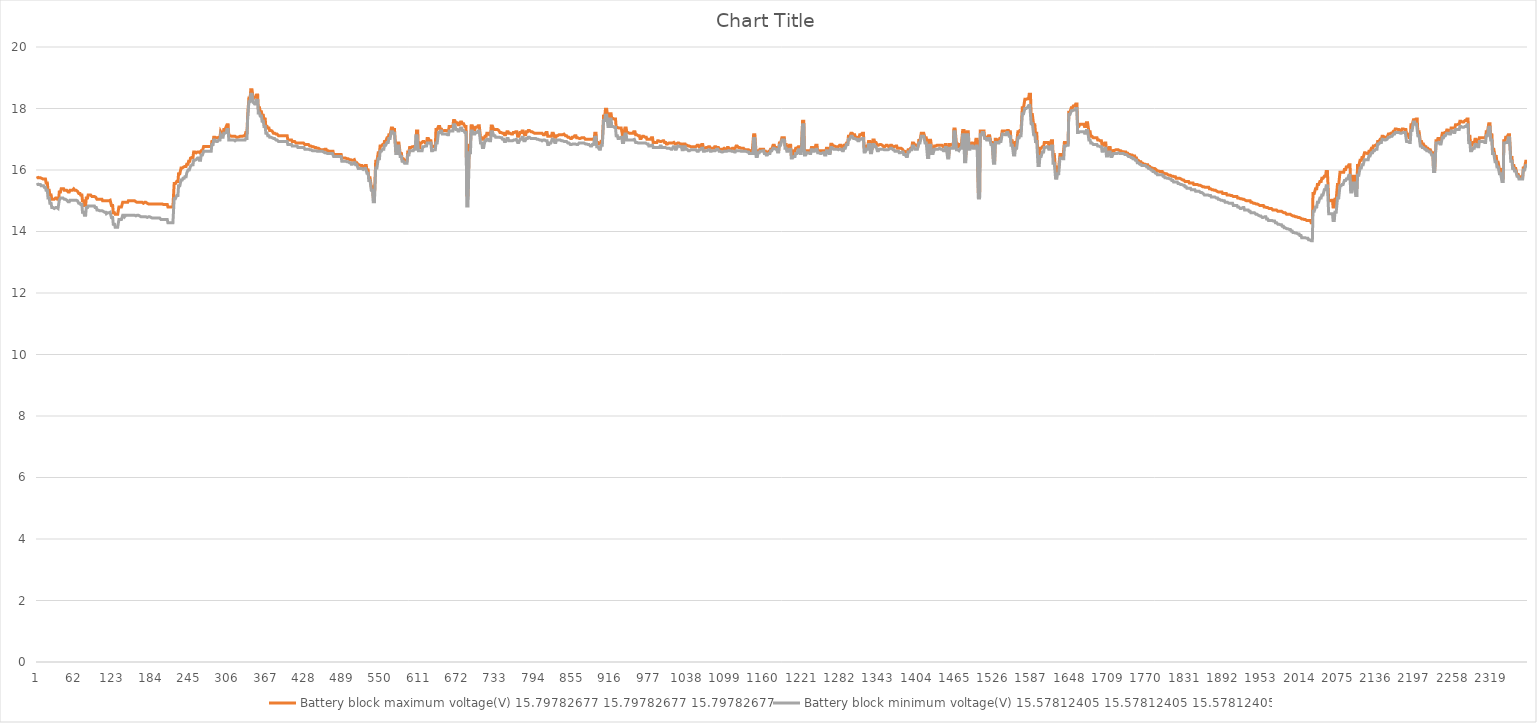
| Category | Battery block maximum voltage(V) | Battery block minimum voltage(V) |
|---|---|---|
| 0 | 15.798 | 15.578 |
| 1 | 15.748 | 15.528 |
| 2 | 15.748 | 15.528 |
| 3 | 15.748 | 15.528 |
| 4 | 15.748 | 15.528 |
| 5 | 15.748 | 15.528 |
| 6 | 15.728 | 15.488 |
| 7 | 15.728 | 15.488 |
| 8 | 15.708 | 15.488 |
| 9 | 15.708 | 15.488 |
| 10 | 15.708 | 15.488 |
| 11 | 15.708 | 15.438 |
| 12 | 15.708 | 15.438 |
| 13 | 15.708 | 15.438 |
| 14 | 15.578 | 15.338 |
| 15 | 15.578 | 15.338 |
| 16 | 15.578 | 15.338 |
| 17 | 15.338 | 15.087 |
| 18 | 15.338 | 15.087 |
| 19 | 15.338 | 15.087 |
| 20 | 15.188 | 14.918 |
| 21 | 15.188 | 14.918 |
| 22 | 15.188 | 14.918 |
| 23 | 15.047 | 14.777 |
| 24 | 15.047 | 14.777 |
| 25 | 15.047 | 14.777 |
| 26 | 15.047 | 14.748 |
| 27 | 15.047 | 14.748 |
| 28 | 15.047 | 14.748 |
| 29 | 15.087 | 14.777 |
| 30 | 15.087 | 14.777 |
| 31 | 15.087 | 14.777 |
| 32 | 15.047 | 14.748 |
| 33 | 15.047 | 14.748 |
| 34 | 15.047 | 14.748 |
| 35 | 15.288 | 15.018 |
| 36 | 15.288 | 15.018 |
| 37 | 15.288 | 15.087 |
| 38 | 15.388 | 15.087 |
| 39 | 15.388 | 15.087 |
| 40 | 15.388 | 15.087 |
| 41 | 15.388 | 15.087 |
| 42 | 15.388 | 15.087 |
| 43 | 15.338 | 15.047 |
| 44 | 15.338 | 15.047 |
| 45 | 15.338 | 15.047 |
| 46 | 15.338 | 15.018 |
| 47 | 15.338 | 15.018 |
| 48 | 15.338 | 15.018 |
| 49 | 15.288 | 14.968 |
| 50 | 15.288 | 14.968 |
| 51 | 15.288 | 14.968 |
| 52 | 15.338 | 15.018 |
| 53 | 15.338 | 15.018 |
| 54 | 15.338 | 15.018 |
| 55 | 15.338 | 15.018 |
| 56 | 15.338 | 15.018 |
| 57 | 15.338 | 15.018 |
| 58 | 15.388 | 15.018 |
| 59 | 15.388 | 15.018 |
| 60 | 15.338 | 15.018 |
| 61 | 15.338 | 15.018 |
| 62 | 15.338 | 15.018 |
| 63 | 15.307 | 14.998 |
| 64 | 15.307 | 14.998 |
| 65 | 15.307 | 14.998 |
| 66 | 15.238 | 14.918 |
| 67 | 15.238 | 14.918 |
| 68 | 15.238 | 14.918 |
| 69 | 15.188 | 14.878 |
| 70 | 15.188 | 14.878 |
| 71 | 15.188 | 14.878 |
| 72 | 14.998 | 14.627 |
| 73 | 14.998 | 14.627 |
| 74 | 14.998 | 14.627 |
| 75 | 14.848 | 14.527 |
| 76 | 14.848 | 14.527 |
| 77 | 14.848 | 14.527 |
| 78 | 15.087 | 14.777 |
| 79 | 15.087 | 14.777 |
| 80 | 15.087 | 14.777 |
| 81 | 15.188 | 14.827 |
| 82 | 15.188 | 14.827 |
| 83 | 15.188 | 14.827 |
| 84 | 15.188 | 14.827 |
| 85 | 15.188 | 14.827 |
| 86 | 15.188 | 14.827 |
| 87 | 15.137 | 14.827 |
| 88 | 15.137 | 14.827 |
| 89 | 15.137 | 14.827 |
| 90 | 15.137 | 14.827 |
| 91 | 15.137 | 14.827 |
| 92 | 15.118 | 14.777 |
| 93 | 15.118 | 14.777 |
| 94 | 15.118 | 14.777 |
| 95 | 15.047 | 14.698 |
| 96 | 15.047 | 14.698 |
| 97 | 15.047 | 14.698 |
| 98 | 15.047 | 14.677 |
| 99 | 15.047 | 14.677 |
| 100 | 15.047 | 14.677 |
| 101 | 15.047 | 14.677 |
| 102 | 15.047 | 14.677 |
| 103 | 15.047 | 14.677 |
| 104 | 14.998 | 14.658 |
| 105 | 14.998 | 14.658 |
| 106 | 14.998 | 14.658 |
| 107 | 14.998 | 14.627 |
| 108 | 14.998 | 14.627 |
| 109 | 14.998 | 14.627 |
| 110 | 14.998 | 14.577 |
| 111 | 14.998 | 14.577 |
| 112 | 14.998 | 14.608 |
| 113 | 14.998 | 14.608 |
| 114 | 14.998 | 14.608 |
| 115 | 15.018 | 14.627 |
| 116 | 15.018 | 14.627 |
| 117 | 15.018 | 14.627 |
| 118 | 14.848 | 14.458 |
| 119 | 14.848 | 14.458 |
| 120 | 14.848 | 14.458 |
| 121 | 14.608 | 14.238 |
| 122 | 14.608 | 14.238 |
| 123 | 14.608 | 14.238 |
| 124 | 14.558 | 14.138 |
| 125 | 14.558 | 14.138 |
| 126 | 14.558 | 14.138 |
| 127 | 14.558 | 14.138 |
| 128 | 14.558 | 14.138 |
| 129 | 14.558 | 14.138 |
| 130 | 14.798 | 14.388 |
| 131 | 14.798 | 14.388 |
| 132 | 14.798 | 14.388 |
| 133 | 14.798 | 14.388 |
| 134 | 14.798 | 14.388 |
| 135 | 14.798 | 14.388 |
| 136 | 14.948 | 14.527 |
| 137 | 14.948 | 14.527 |
| 138 | 14.948 | 14.527 |
| 139 | 14.948 | 14.478 |
| 140 | 14.948 | 14.478 |
| 141 | 14.948 | 14.527 |
| 142 | 14.948 | 14.527 |
| 143 | 14.948 | 14.527 |
| 144 | 14.948 | 14.527 |
| 145 | 14.998 | 14.527 |
| 146 | 14.998 | 14.527 |
| 147 | 14.998 | 14.527 |
| 148 | 14.998 | 14.527 |
| 149 | 14.998 | 14.527 |
| 150 | 14.998 | 14.527 |
| 151 | 14.998 | 14.527 |
| 152 | 14.998 | 14.527 |
| 153 | 14.998 | 14.527 |
| 154 | 14.998 | 14.527 |
| 155 | 14.998 | 14.527 |
| 156 | 14.968 | 14.508 |
| 157 | 14.968 | 14.508 |
| 158 | 14.968 | 14.508 |
| 159 | 14.948 | 14.527 |
| 160 | 14.948 | 14.527 |
| 161 | 14.948 | 14.527 |
| 162 | 14.948 | 14.508 |
| 163 | 14.948 | 14.508 |
| 164 | 14.948 | 14.508 |
| 165 | 14.948 | 14.478 |
| 166 | 14.948 | 14.478 |
| 167 | 14.948 | 14.478 |
| 168 | 14.918 | 14.478 |
| 169 | 14.918 | 14.478 |
| 170 | 14.918 | 14.478 |
| 171 | 14.948 | 14.478 |
| 172 | 14.948 | 14.478 |
| 173 | 14.948 | 14.478 |
| 174 | 14.918 | 14.458 |
| 175 | 14.918 | 14.458 |
| 176 | 14.898 | 14.478 |
| 177 | 14.898 | 14.478 |
| 178 | 14.898 | 14.478 |
| 179 | 14.898 | 14.478 |
| 180 | 14.898 | 14.458 |
| 181 | 14.898 | 14.458 |
| 182 | 14.898 | 14.438 |
| 183 | 14.898 | 14.438 |
| 184 | 14.898 | 14.438 |
| 185 | 14.898 | 14.438 |
| 186 | 14.898 | 14.438 |
| 187 | 14.898 | 14.438 |
| 188 | 14.898 | 14.438 |
| 189 | 14.898 | 14.438 |
| 190 | 14.898 | 14.438 |
| 191 | 14.898 | 14.438 |
| 192 | 14.898 | 14.438 |
| 193 | 14.898 | 14.438 |
| 194 | 14.898 | 14.438 |
| 195 | 14.898 | 14.438 |
| 196 | 14.898 | 14.438 |
| 197 | 14.898 | 14.388 |
| 198 | 14.898 | 14.388 |
| 199 | 14.898 | 14.388 |
| 200 | 14.878 | 14.388 |
| 201 | 14.878 | 14.388 |
| 202 | 14.878 | 14.388 |
| 203 | 14.878 | 14.388 |
| 204 | 14.878 | 14.388 |
| 205 | 14.878 | 14.388 |
| 206 | 14.878 | 14.388 |
| 207 | 14.878 | 14.388 |
| 208 | 14.798 | 14.288 |
| 209 | 14.798 | 14.288 |
| 210 | 14.798 | 14.288 |
| 211 | 14.798 | 14.288 |
| 212 | 14.798 | 14.288 |
| 213 | 14.798 | 14.288 |
| 214 | 14.798 | 14.288 |
| 215 | 14.798 | 14.288 |
| 216 | 14.798 | 14.288 |
| 217 | 14.798 | 14.288 |
| 218 | 15.557 | 15.068 |
| 219 | 15.557 | 15.068 |
| 220 | 15.557 | 15.068 |
| 221 | 15.557 | 15.068 |
| 222 | 15.628 | 15.168 |
| 223 | 15.628 | 15.168 |
| 224 | 15.628 | 15.168 |
| 225 | 15.877 | 15.488 |
| 226 | 15.877 | 15.488 |
| 227 | 15.877 | 15.488 |
| 228 | 15.877 | 15.488 |
| 229 | 16.068 | 15.678 |
| 230 | 16.068 | 15.678 |
| 231 | 16.068 | 15.678 |
| 232 | 16.098 | 15.728 |
| 233 | 16.098 | 15.728 |
| 234 | 16.098 | 15.728 |
| 235 | 16.118 | 15.777 |
| 236 | 16.118 | 15.777 |
| 237 | 16.118 | 15.777 |
| 238 | 16.187 | 15.898 |
| 239 | 16.187 | 15.898 |
| 240 | 16.187 | 15.998 |
| 241 | 16.287 | 15.998 |
| 242 | 16.287 | 15.998 |
| 243 | 16.287 | 15.998 |
| 244 | 16.387 | 16.118 |
| 245 | 16.387 | 16.118 |
| 246 | 16.408 | 16.168 |
| 247 | 16.408 | 16.168 |
| 248 | 16.408 | 16.168 |
| 249 | 16.588 | 16.318 |
| 250 | 16.588 | 16.318 |
| 251 | 16.588 | 16.318 |
| 252 | 16.588 | 16.318 |
| 253 | 16.557 | 16.337 |
| 254 | 16.557 | 16.337 |
| 255 | 16.588 | 16.387 |
| 256 | 16.588 | 16.387 |
| 257 | 16.588 | 16.387 |
| 258 | 16.557 | 16.318 |
| 259 | 16.557 | 16.318 |
| 260 | 16.557 | 16.318 |
| 261 | 16.628 | 16.487 |
| 262 | 16.628 | 16.487 |
| 263 | 16.628 | 16.487 |
| 264 | 16.628 | 16.487 |
| 265 | 16.767 | 16.607 |
| 266 | 16.767 | 16.607 |
| 267 | 16.767 | 16.607 |
| 268 | 16.767 | 16.607 |
| 269 | 16.767 | 16.607 |
| 270 | 16.767 | 16.607 |
| 271 | 16.767 | 16.607 |
| 272 | 16.767 | 16.607 |
| 273 | 16.767 | 16.607 |
| 274 | 16.767 | 16.607 |
| 275 | 16.767 | 16.607 |
| 276 | 16.767 | 16.607 |
| 277 | 16.767 | 16.607 |
| 278 | 16.928 | 16.828 |
| 279 | 16.928 | 16.828 |
| 280 | 16.928 | 16.828 |
| 281 | 17.067 | 16.978 |
| 282 | 17.067 | 16.978 |
| 283 | 17.067 | 16.978 |
| 284 | 17.067 | 16.978 |
| 285 | 17.048 | 16.928 |
| 286 | 17.048 | 16.928 |
| 287 | 17.048 | 16.928 |
| 288 | 17.048 | 16.928 |
| 289 | 17.067 | 16.978 |
| 290 | 17.067 | 16.978 |
| 291 | 17.067 | 16.978 |
| 292 | 17.248 | 17.148 |
| 293 | 17.248 | 17.148 |
| 294 | 17.167 | 17.067 |
| 295 | 17.167 | 17.067 |
| 296 | 17.167 | 17.067 |
| 297 | 17.317 | 17.198 |
| 298 | 17.317 | 17.198 |
| 299 | 17.317 | 17.198 |
| 300 | 17.367 | 17.217 |
| 301 | 17.367 | 17.217 |
| 302 | 17.468 | 17.317 |
| 303 | 17.468 | 17.317 |
| 304 | 17.468 | 17.317 |
| 305 | 17.117 | 16.978 |
| 306 | 17.117 | 16.978 |
| 307 | 17.117 | 16.978 |
| 308 | 17.098 | 16.978 |
| 309 | 17.098 | 16.978 |
| 310 | 17.098 | 16.978 |
| 311 | 17.098 | 16.978 |
| 312 | 17.098 | 16.978 |
| 313 | 17.098 | 16.978 |
| 314 | 17.098 | 16.948 |
| 315 | 17.098 | 16.948 |
| 316 | 17.098 | 16.948 |
| 317 | 17.067 | 16.978 |
| 318 | 17.067 | 16.978 |
| 319 | 17.067 | 16.978 |
| 320 | 17.077 | 16.978 |
| 321 | 17.077 | 16.978 |
| 322 | 17.077 | 16.978 |
| 323 | 17.098 | 16.978 |
| 324 | 17.098 | 16.978 |
| 325 | 17.098 | 16.978 |
| 326 | 17.098 | 16.978 |
| 327 | 17.098 | 16.978 |
| 328 | 17.098 | 16.978 |
| 329 | 17.117 | 16.978 |
| 330 | 17.117 | 16.978 |
| 331 | 17.117 | 16.978 |
| 332 | 17.217 | 17.027 |
| 333 | 17.217 | 17.027 |
| 334 | 17.217 | 17.027 |
| 335 | 17.757 | 17.637 |
| 336 | 17.757 | 17.637 |
| 337 | 18.338 | 18.217 |
| 338 | 18.338 | 18.217 |
| 339 | 18.338 | 18.217 |
| 340 | 18.608 | 18.467 |
| 341 | 18.608 | 18.467 |
| 342 | 18.608 | 18.467 |
| 343 | 18.608 | 18.467 |
| 344 | 18.317 | 18.197 |
| 345 | 18.317 | 18.197 |
| 346 | 18.367 | 18.147 |
| 347 | 18.367 | 18.147 |
| 348 | 18.367 | 18.147 |
| 349 | 18.438 | 18.267 |
| 350 | 18.438 | 18.267 |
| 351 | 18.438 | 18.267 |
| 352 | 18.028 | 17.857 |
| 353 | 18.028 | 17.857 |
| 354 | 18.028 | 17.857 |
| 355 | 17.897 | 17.757 |
| 356 | 17.897 | 17.757 |
| 357 | 17.897 | 17.757 |
| 358 | 17.778 | 17.587 |
| 359 | 17.778 | 17.587 |
| 360 | 17.778 | 17.587 |
| 361 | 17.658 | 17.418 |
| 362 | 17.658 | 17.418 |
| 363 | 17.658 | 17.418 |
| 364 | 17.418 | 17.198 |
| 365 | 17.418 | 17.198 |
| 366 | 17.418 | 17.198 |
| 367 | 17.367 | 17.117 |
| 368 | 17.367 | 17.117 |
| 369 | 17.367 | 17.117 |
| 370 | 17.287 | 17.067 |
| 371 | 17.287 | 17.067 |
| 372 | 17.287 | 17.067 |
| 373 | 17.267 | 17.048 |
| 374 | 17.267 | 17.048 |
| 375 | 17.267 | 17.048 |
| 376 | 17.198 | 17.027 |
| 377 | 17.198 | 17.027 |
| 378 | 17.198 | 17.027 |
| 379 | 17.198 | 17.027 |
| 380 | 17.167 | 16.978 |
| 381 | 17.167 | 16.978 |
| 382 | 17.167 | 16.978 |
| 383 | 17.167 | 16.978 |
| 384 | 17.117 | 16.928 |
| 385 | 17.117 | 16.928 |
| 386 | 17.117 | 16.928 |
| 387 | 17.117 | 16.928 |
| 388 | 17.117 | 16.928 |
| 389 | 17.117 | 16.928 |
| 390 | 17.117 | 16.928 |
| 391 | 17.117 | 16.928 |
| 392 | 17.117 | 16.928 |
| 393 | 17.117 | 16.928 |
| 394 | 17.117 | 16.928 |
| 395 | 17.117 | 16.928 |
| 396 | 17.117 | 16.928 |
| 397 | 17.117 | 16.928 |
| 398 | 17.117 | 16.928 |
| 399 | 16.978 | 16.828 |
| 400 | 16.978 | 16.828 |
| 401 | 16.978 | 16.828 |
| 402 | 16.978 | 16.828 |
| 403 | 16.978 | 16.828 |
| 404 | 16.978 | 16.828 |
| 405 | 16.978 | 16.828 |
| 406 | 16.928 | 16.778 |
| 407 | 16.928 | 16.778 |
| 408 | 16.928 | 16.778 |
| 409 | 16.928 | 16.778 |
| 410 | 16.928 | 16.778 |
| 411 | 16.928 | 16.778 |
| 412 | 16.878 | 16.778 |
| 413 | 16.878 | 16.778 |
| 414 | 16.878 | 16.778 |
| 415 | 16.878 | 16.728 |
| 416 | 16.878 | 16.728 |
| 417 | 16.878 | 16.728 |
| 418 | 16.878 | 16.728 |
| 419 | 16.878 | 16.728 |
| 420 | 16.878 | 16.728 |
| 421 | 16.878 | 16.728 |
| 422 | 16.878 | 16.728 |
| 423 | 16.878 | 16.728 |
| 424 | 16.878 | 16.728 |
| 425 | 16.878 | 16.728 |
| 426 | 16.828 | 16.678 |
| 427 | 16.828 | 16.678 |
| 428 | 16.828 | 16.678 |
| 429 | 16.828 | 16.678 |
| 430 | 16.828 | 16.678 |
| 431 | 16.828 | 16.678 |
| 432 | 16.828 | 16.678 |
| 433 | 16.828 | 16.678 |
| 434 | 16.778 | 16.657 |
| 435 | 16.778 | 16.657 |
| 436 | 16.778 | 16.657 |
| 437 | 16.778 | 16.657 |
| 438 | 16.757 | 16.628 |
| 439 | 16.757 | 16.628 |
| 440 | 16.757 | 16.628 |
| 441 | 16.728 | 16.628 |
| 442 | 16.728 | 16.628 |
| 443 | 16.728 | 16.628 |
| 444 | 16.728 | 16.628 |
| 445 | 16.728 | 16.628 |
| 446 | 16.707 | 16.607 |
| 447 | 16.707 | 16.607 |
| 448 | 16.707 | 16.607 |
| 449 | 16.678 | 16.607 |
| 450 | 16.678 | 16.607 |
| 451 | 16.678 | 16.607 |
| 452 | 16.657 | 16.607 |
| 453 | 16.657 | 16.607 |
| 454 | 16.657 | 16.607 |
| 455 | 16.657 | 16.588 |
| 456 | 16.657 | 16.588 |
| 457 | 16.657 | 16.588 |
| 458 | 16.678 | 16.557 |
| 459 | 16.678 | 16.557 |
| 460 | 16.678 | 16.557 |
| 461 | 16.628 | 16.537 |
| 462 | 16.628 | 16.537 |
| 463 | 16.628 | 16.537 |
| 464 | 16.607 | 16.537 |
| 465 | 16.607 | 16.537 |
| 466 | 16.607 | 16.537 |
| 467 | 16.607 | 16.537 |
| 468 | 16.607 | 16.537 |
| 469 | 16.607 | 16.537 |
| 470 | 16.607 | 16.537 |
| 471 | 16.607 | 16.537 |
| 472 | 16.507 | 16.437 |
| 473 | 16.507 | 16.437 |
| 474 | 16.507 | 16.437 |
| 475 | 16.507 | 16.437 |
| 476 | 16.507 | 16.437 |
| 477 | 16.507 | 16.437 |
| 478 | 16.507 | 16.437 |
| 479 | 16.507 | 16.437 |
| 480 | 16.507 | 16.437 |
| 481 | 16.507 | 16.437 |
| 482 | 16.507 | 16.437 |
| 483 | 16.507 | 16.437 |
| 484 | 16.507 | 16.437 |
| 485 | 16.387 | 16.287 |
| 486 | 16.387 | 16.287 |
| 487 | 16.387 | 16.287 |
| 488 | 16.387 | 16.287 |
| 489 | 16.387 | 16.287 |
| 490 | 16.387 | 16.287 |
| 491 | 16.387 | 16.287 |
| 492 | 16.368 | 16.268 |
| 493 | 16.368 | 16.268 |
| 494 | 16.368 | 16.268 |
| 495 | 16.368 | 16.268 |
| 496 | 16.368 | 16.268 |
| 497 | 16.337 | 16.237 |
| 498 | 16.337 | 16.237 |
| 499 | 16.337 | 16.237 |
| 500 | 16.318 | 16.187 |
| 501 | 16.318 | 16.187 |
| 502 | 16.318 | 16.187 |
| 503 | 16.318 | 16.187 |
| 504 | 16.337 | 16.237 |
| 505 | 16.337 | 16.237 |
| 506 | 16.337 | 16.237 |
| 507 | 16.237 | 16.168 |
| 508 | 16.237 | 16.168 |
| 509 | 16.237 | 16.168 |
| 510 | 16.237 | 16.168 |
| 511 | 16.168 | 16.048 |
| 512 | 16.168 | 16.048 |
| 513 | 16.168 | 16.048 |
| 514 | 16.168 | 16.048 |
| 515 | 16.148 | 16.048 |
| 516 | 16.148 | 16.048 |
| 517 | 16.148 | 16.048 |
| 518 | 16.098 | 16.018 |
| 519 | 16.098 | 16.018 |
| 520 | 16.098 | 16.018 |
| 521 | 16.098 | 16.048 |
| 522 | 16.148 | 16.048 |
| 523 | 16.148 | 16.048 |
| 524 | 16.148 | 16.048 |
| 525 | 15.998 | 15.898 |
| 526 | 15.998 | 15.898 |
| 527 | 15.998 | 15.898 |
| 528 | 15.748 | 15.657 |
| 529 | 15.748 | 15.657 |
| 530 | 15.748 | 15.657 |
| 531 | 15.748 | 15.657 |
| 532 | 15.457 | 15.338 |
| 533 | 15.457 | 15.338 |
| 534 | 15.457 | 15.338 |
| 535 | 15.137 | 14.968 |
| 536 | 15.137 | 14.968 |
| 537 | 15.137 | 14.968 |
| 538 | 15.137 | 14.968 |
| 539 | 16.287 | 16.068 |
| 540 | 16.287 | 16.068 |
| 541 | 16.287 | 16.068 |
| 542 | 16.287 | 16.068 |
| 543 | 16.557 | 16.368 |
| 544 | 16.557 | 16.368 |
| 545 | 16.557 | 16.368 |
| 546 | 16.778 | 16.607 |
| 547 | 16.778 | 16.607 |
| 548 | 16.778 | 16.607 |
| 549 | 16.778 | 16.607 |
| 550 | 16.828 | 16.678 |
| 551 | 16.828 | 16.678 |
| 552 | 16.828 | 16.678 |
| 553 | 16.928 | 16.807 |
| 554 | 16.928 | 16.807 |
| 555 | 16.928 | 16.807 |
| 556 | 16.928 | 16.807 |
| 557 | 17.048 | 16.898 |
| 558 | 17.048 | 16.898 |
| 559 | 17.048 | 16.898 |
| 560 | 17.148 | 17.027 |
| 561 | 17.148 | 17.027 |
| 562 | 17.148 | 17.027 |
| 563 | 17.148 | 17.027 |
| 564 | 17.367 | 17.248 |
| 565 | 17.367 | 17.248 |
| 566 | 17.367 | 17.248 |
| 567 | 17.317 | 17.198 |
| 568 | 17.317 | 17.198 |
| 569 | 17.317 | 17.198 |
| 570 | 17.317 | 17.198 |
| 571 | 16.628 | 16.537 |
| 572 | 16.628 | 16.537 |
| 573 | 16.628 | 16.537 |
| 574 | 16.878 | 16.778 |
| 575 | 16.878 | 16.778 |
| 576 | 16.878 | 16.778 |
| 577 | 16.878 | 16.778 |
| 578 | 16.537 | 16.437 |
| 579 | 16.537 | 16.437 |
| 580 | 16.537 | 16.437 |
| 581 | 16.368 | 16.287 |
| 582 | 16.368 | 16.287 |
| 583 | 16.368 | 16.287 |
| 584 | 16.368 | 16.287 |
| 585 | 16.318 | 16.218 |
| 586 | 16.318 | 16.218 |
| 587 | 16.318 | 16.218 |
| 588 | 16.318 | 16.218 |
| 589 | 16.318 | 16.218 |
| 590 | 16.588 | 16.487 |
| 591 | 16.588 | 16.487 |
| 592 | 16.588 | 16.487 |
| 593 | 16.728 | 16.628 |
| 594 | 16.728 | 16.628 |
| 595 | 16.728 | 16.628 |
| 596 | 16.728 | 16.628 |
| 597 | 16.757 | 16.628 |
| 598 | 16.757 | 16.628 |
| 599 | 16.757 | 16.628 |
| 600 | 16.778 | 16.678 |
| 601 | 16.778 | 16.678 |
| 602 | 16.778 | 16.678 |
| 603 | 16.778 | 17.117 |
| 604 | 17.267 | 17.117 |
| 605 | 17.267 | 17.117 |
| 606 | 17.267 | 17.117 |
| 607 | 16.728 | 16.628 |
| 608 | 16.728 | 16.628 |
| 609 | 16.728 | 16.628 |
| 610 | 16.878 | 16.628 |
| 611 | 16.878 | 16.628 |
| 612 | 16.878 | 16.628 |
| 613 | 16.878 | 16.628 |
| 614 | 16.928 | 16.757 |
| 615 | 16.928 | 16.757 |
| 616 | 16.928 | 16.757 |
| 617 | 16.928 | 16.757 |
| 618 | 16.878 | 16.778 |
| 619 | 16.878 | 16.778 |
| 620 | 16.878 | 16.778 |
| 621 | 17.027 | 16.878 |
| 622 | 17.027 | 16.878 |
| 623 | 17.027 | 16.878 |
| 624 | 17.027 | 16.878 |
| 625 | 16.948 | 16.878 |
| 626 | 16.948 | 16.878 |
| 627 | 16.948 | 16.878 |
| 628 | 16.757 | 16.628 |
| 629 | 16.757 | 16.628 |
| 630 | 16.757 | 16.628 |
| 631 | 16.757 | 16.628 |
| 632 | 16.778 | 16.657 |
| 633 | 16.778 | 16.657 |
| 634 | 16.778 | 16.657 |
| 635 | 17.317 | 16.878 |
| 636 | 17.317 | 16.878 |
| 637 | 17.317 | 16.878 |
| 638 | 17.317 | 16.878 |
| 639 | 17.418 | 17.217 |
| 640 | 17.418 | 17.217 |
| 641 | 17.418 | 17.217 |
| 642 | 17.327 | 17.267 |
| 643 | 17.327 | 17.267 |
| 644 | 17.327 | 17.267 |
| 645 | 17.277 | 17.167 |
| 646 | 17.277 | 17.167 |
| 647 | 17.277 | 17.167 |
| 648 | 17.277 | 17.167 |
| 649 | 17.287 | 17.167 |
| 650 | 17.287 | 17.167 |
| 651 | 17.287 | 17.167 |
| 652 | 17.287 | 17.167 |
| 653 | 17.267 | 17.148 |
| 654 | 17.267 | 17.148 |
| 655 | 17.267 | 17.148 |
| 656 | 17.418 | 17.267 |
| 657 | 17.418 | 17.267 |
| 658 | 17.418 | 17.267 |
| 659 | 17.418 | 17.267 |
| 660 | 17.418 | 17.267 |
| 661 | 17.418 | 17.267 |
| 662 | 17.418 | 17.267 |
| 663 | 17.608 | 17.468 |
| 664 | 17.608 | 17.468 |
| 665 | 17.608 | 17.468 |
| 666 | 17.608 | 17.468 |
| 667 | 17.537 | 17.317 |
| 668 | 17.537 | 17.317 |
| 669 | 17.537 | 17.317 |
| 670 | 17.468 | 17.267 |
| 671 | 17.468 | 17.267 |
| 672 | 17.468 | 17.267 |
| 673 | 17.468 | 17.267 |
| 674 | 17.558 | 17.367 |
| 675 | 17.558 | 17.367 |
| 676 | 17.558 | 17.367 |
| 677 | 17.508 | 17.287 |
| 678 | 17.508 | 17.287 |
| 679 | 17.508 | 17.287 |
| 680 | 17.508 | 17.287 |
| 681 | 17.418 | 17.217 |
| 682 | 17.418 | 17.217 |
| 683 | 17.418 | 17.217 |
| 684 | 15.188 | 14.827 |
| 685 | 15.188 | 14.827 |
| 686 | 15.188 | 14.827 |
| 687 | 15.188 | 14.827 |
| 688 | 16.807 | 16.557 |
| 689 | 16.807 | 16.557 |
| 690 | 16.807 | 16.557 |
| 691 | 17.437 | 17.267 |
| 692 | 17.437 | 17.267 |
| 693 | 17.437 | 17.267 |
| 694 | 17.437 | 17.267 |
| 695 | 17.317 | 17.167 |
| 696 | 17.317 | 17.167 |
| 697 | 17.317 | 17.167 |
| 698 | 17.387 | 17.217 |
| 699 | 17.387 | 17.217 |
| 700 | 17.387 | 17.217 |
| 701 | 17.387 | 17.217 |
| 702 | 17.437 | 17.267 |
| 703 | 17.437 | 17.267 |
| 704 | 17.437 | 17.267 |
| 705 | 17.437 | 17.267 |
| 706 | 17.048 | 16.878 |
| 707 | 17.048 | 16.878 |
| 708 | 17.048 | 16.878 |
| 709 | 16.998 | 16.728 |
| 710 | 16.998 | 16.728 |
| 711 | 16.998 | 16.728 |
| 712 | 16.998 | 16.728 |
| 713 | 17.098 | 16.948 |
| 714 | 17.098 | 16.948 |
| 715 | 17.098 | 16.948 |
| 716 | 17.198 | 16.998 |
| 717 | 17.198 | 16.998 |
| 718 | 17.198 | 16.998 |
| 719 | 17.198 | 16.998 |
| 720 | 17.148 | 16.948 |
| 721 | 17.148 | 16.948 |
| 722 | 17.148 | 16.948 |
| 723 | 17.427 | 17.248 |
| 724 | 17.427 | 17.248 |
| 725 | 17.427 | 17.248 |
| 726 | 17.427 | 17.248 |
| 727 | 17.317 | 17.117 |
| 728 | 17.317 | 17.117 |
| 729 | 17.317 | 17.117 |
| 730 | 17.317 | 17.067 |
| 731 | 17.317 | 17.067 |
| 732 | 17.317 | 17.067 |
| 733 | 17.317 | 17.067 |
| 734 | 17.287 | 17.067 |
| 735 | 17.287 | 17.067 |
| 736 | 17.287 | 17.067 |
| 737 | 17.217 | 17.048 |
| 738 | 17.217 | 17.048 |
| 739 | 17.217 | 17.048 |
| 740 | 17.217 | 17.048 |
| 741 | 17.198 | 16.998 |
| 742 | 17.198 | 16.998 |
| 743 | 17.198 | 16.998 |
| 744 | 17.148 | 16.928 |
| 745 | 17.148 | 16.928 |
| 746 | 17.148 | 16.928 |
| 747 | 17.148 | 16.928 |
| 748 | 17.248 | 17.027 |
| 749 | 17.248 | 17.027 |
| 750 | 17.248 | 17.027 |
| 751 | 17.198 | 16.948 |
| 752 | 17.198 | 16.948 |
| 753 | 17.198 | 16.948 |
| 754 | 17.198 | 16.948 |
| 755 | 17.167 | 16.948 |
| 756 | 17.167 | 16.948 |
| 757 | 17.167 | 16.948 |
| 758 | 17.217 | 16.978 |
| 759 | 17.217 | 16.978 |
| 760 | 17.217 | 16.978 |
| 761 | 17.217 | 16.978 |
| 762 | 17.248 | 16.998 |
| 763 | 17.248 | 16.998 |
| 764 | 17.248 | 16.998 |
| 765 | 17.098 | 16.898 |
| 766 | 17.098 | 16.898 |
| 767 | 17.098 | 16.898 |
| 768 | 17.098 | 16.898 |
| 769 | 17.217 | 16.998 |
| 770 | 17.217 | 16.998 |
| 771 | 17.217 | 16.998 |
| 772 | 17.267 | 17.067 |
| 773 | 17.267 | 17.067 |
| 774 | 17.267 | 17.067 |
| 775 | 17.267 | 16.948 |
| 776 | 17.148 | 16.948 |
| 777 | 17.148 | 16.948 |
| 778 | 17.148 | 16.948 |
| 779 | 17.248 | 17.027 |
| 780 | 17.248 | 17.027 |
| 781 | 17.248 | 17.027 |
| 782 | 17.287 | 17.067 |
| 783 | 17.287 | 17.067 |
| 784 | 17.287 | 17.067 |
| 785 | 17.287 | 17.067 |
| 786 | 17.248 | 17.027 |
| 787 | 17.248 | 17.027 |
| 788 | 17.248 | 17.027 |
| 789 | 17.217 | 17.027 |
| 790 | 17.217 | 17.027 |
| 791 | 17.217 | 17.027 |
| 792 | 17.198 | 17.027 |
| 793 | 17.198 | 17.027 |
| 794 | 17.198 | 17.027 |
| 795 | 17.198 | 16.998 |
| 796 | 17.198 | 16.998 |
| 797 | 17.198 | 16.998 |
| 798 | 17.198 | 16.998 |
| 799 | 17.198 | 16.978 |
| 800 | 17.198 | 16.978 |
| 801 | 17.198 | 16.978 |
| 802 | 17.198 | 16.978 |
| 803 | 17.198 | 16.948 |
| 804 | 17.198 | 16.948 |
| 805 | 17.198 | 16.948 |
| 806 | 17.148 | 16.978 |
| 807 | 17.148 | 16.978 |
| 808 | 17.148 | 16.978 |
| 809 | 17.148 | 16.978 |
| 810 | 17.217 | 16.948 |
| 811 | 17.217 | 16.948 |
| 812 | 17.217 | 16.948 |
| 813 | 17.098 | 16.828 |
| 814 | 17.098 | 16.828 |
| 815 | 17.098 | 16.828 |
| 816 | 17.098 | 16.878 |
| 817 | 17.098 | 16.878 |
| 818 | 17.098 | 16.878 |
| 819 | 17.098 | 16.878 |
| 820 | 17.198 | 16.998 |
| 821 | 17.198 | 16.998 |
| 822 | 17.198 | 16.998 |
| 823 | 17.198 | 16.998 |
| 824 | 17.067 | 16.898 |
| 825 | 17.067 | 16.898 |
| 826 | 17.067 | 16.898 |
| 827 | 17.117 | 16.978 |
| 828 | 17.117 | 16.978 |
| 829 | 17.117 | 16.978 |
| 830 | 17.117 | 16.978 |
| 831 | 17.148 | 16.978 |
| 832 | 17.148 | 16.978 |
| 833 | 17.148 | 16.978 |
| 834 | 17.148 | 16.948 |
| 835 | 17.148 | 16.948 |
| 836 | 17.148 | 16.948 |
| 837 | 17.148 | 16.948 |
| 838 | 17.167 | 16.928 |
| 839 | 17.167 | 16.928 |
| 840 | 17.167 | 16.928 |
| 841 | 17.117 | 16.928 |
| 842 | 17.117 | 16.928 |
| 843 | 17.117 | 16.928 |
| 844 | 17.117 | 16.928 |
| 845 | 17.067 | 16.878 |
| 846 | 17.067 | 16.878 |
| 847 | 17.067 | 16.878 |
| 848 | 17.067 | 16.878 |
| 849 | 17.027 | 16.828 |
| 850 | 17.027 | 16.828 |
| 851 | 17.027 | 16.828 |
| 852 | 17.067 | 16.848 |
| 853 | 17.067 | 16.848 |
| 854 | 17.067 | 16.848 |
| 855 | 17.067 | 16.848 |
| 856 | 17.117 | 16.848 |
| 857 | 17.117 | 16.848 |
| 858 | 17.117 | 16.848 |
| 859 | 17.048 | 16.828 |
| 860 | 17.048 | 16.828 |
| 861 | 17.048 | 16.828 |
| 862 | 17.048 | 16.828 |
| 863 | 17.027 | 16.878 |
| 864 | 17.027 | 16.878 |
| 865 | 17.027 | 16.878 |
| 866 | 17.048 | 16.878 |
| 867 | 17.048 | 16.878 |
| 868 | 17.048 | 16.878 |
| 869 | 17.048 | 16.878 |
| 870 | 17.048 | 16.878 |
| 871 | 17.048 | 16.878 |
| 872 | 17.048 | 16.878 |
| 873 | 16.998 | 16.848 |
| 874 | 16.998 | 16.848 |
| 875 | 16.998 | 16.848 |
| 876 | 16.998 | 16.848 |
| 877 | 16.998 | 16.828 |
| 878 | 16.998 | 16.828 |
| 879 | 16.998 | 16.828 |
| 880 | 16.998 | 16.828 |
| 881 | 16.998 | 16.778 |
| 882 | 16.998 | 16.778 |
| 883 | 16.998 | 16.778 |
| 884 | 16.998 | 16.828 |
| 885 | 16.998 | 16.828 |
| 886 | 16.998 | 16.828 |
| 887 | 16.998 | 16.828 |
| 888 | 17.198 | 17.067 |
| 889 | 17.198 | 17.067 |
| 890 | 17.198 | 17.067 |
| 891 | 16.898 | 16.757 |
| 892 | 16.898 | 16.757 |
| 893 | 16.898 | 16.757 |
| 894 | 16.898 | 16.757 |
| 895 | 16.848 | 16.678 |
| 896 | 16.848 | 16.678 |
| 897 | 16.848 | 16.678 |
| 898 | 16.938 | 16.807 |
| 899 | 16.938 | 16.807 |
| 900 | 16.938 | 16.807 |
| 901 | 16.938 | 16.807 |
| 902 | 17.757 | 17.608 |
| 903 | 17.757 | 17.608 |
| 904 | 17.757 | 17.608 |
| 905 | 17.978 | 17.778 |
| 906 | 17.978 | 17.778 |
| 907 | 17.978 | 17.778 |
| 908 | 17.978 | 17.778 |
| 909 | 17.637 | 17.418 |
| 910 | 17.637 | 17.418 |
| 911 | 17.637 | 17.418 |
| 912 | 17.828 | 17.658 |
| 913 | 17.828 | 17.658 |
| 914 | 17.828 | 17.658 |
| 915 | 17.678 | 17.418 |
| 916 | 17.678 | 17.418 |
| 917 | 17.678 | 17.418 |
| 918 | 17.658 | 17.387 |
| 919 | 17.658 | 17.387 |
| 920 | 17.658 | 17.387 |
| 921 | 17.658 | 17.387 |
| 922 | 17.387 | 17.117 |
| 923 | 17.387 | 17.117 |
| 924 | 17.387 | 17.117 |
| 925 | 17.367 | 17.027 |
| 926 | 17.367 | 17.027 |
| 927 | 17.367 | 17.027 |
| 928 | 17.367 | 17.027 |
| 929 | 17.367 | 17.067 |
| 930 | 17.367 | 17.067 |
| 931 | 17.367 | 17.067 |
| 932 | 17.148 | 16.898 |
| 933 | 17.148 | 16.898 |
| 934 | 17.148 | 16.898 |
| 935 | 17.148 | 16.898 |
| 936 | 17.367 | 17.167 |
| 937 | 17.367 | 17.167 |
| 938 | 17.367 | 17.167 |
| 939 | 17.217 | 16.978 |
| 940 | 17.217 | 16.978 |
| 941 | 17.217 | 16.978 |
| 942 | 17.217 | 16.978 |
| 943 | 17.198 | 16.978 |
| 944 | 17.198 | 16.978 |
| 945 | 17.198 | 16.978 |
| 946 | 17.198 | 16.978 |
| 947 | 17.198 | 16.978 |
| 948 | 17.198 | 16.978 |
| 949 | 17.198 | 16.978 |
| 950 | 17.248 | 16.998 |
| 951 | 17.248 | 16.998 |
| 952 | 17.248 | 16.998 |
| 953 | 17.148 | 16.898 |
| 954 | 17.148 | 16.898 |
| 955 | 17.148 | 16.898 |
| 956 | 17.148 | 16.898 |
| 957 | 17.117 | 16.878 |
| 958 | 17.117 | 16.878 |
| 959 | 17.117 | 16.878 |
| 960 | 17.027 | 16.878 |
| 961 | 17.027 | 16.878 |
| 962 | 17.027 | 16.878 |
| 963 | 17.027 | 16.878 |
| 964 | 17.098 | 16.878 |
| 965 | 17.098 | 16.878 |
| 966 | 17.098 | 16.878 |
| 967 | 17.067 | 16.878 |
| 968 | 17.067 | 16.878 |
| 969 | 17.067 | 16.878 |
| 970 | 17.067 | 16.878 |
| 971 | 16.998 | 16.848 |
| 972 | 16.998 | 16.848 |
| 973 | 16.998 | 16.848 |
| 974 | 16.998 | 16.778 |
| 975 | 16.998 | 16.778 |
| 976 | 16.998 | 16.778 |
| 977 | 16.998 | 16.778 |
| 978 | 17.048 | 16.807 |
| 979 | 17.048 | 16.807 |
| 980 | 17.048 | 16.807 |
| 981 | 16.898 | 16.728 |
| 982 | 16.898 | 16.728 |
| 983 | 16.898 | 16.728 |
| 984 | 16.898 | 16.728 |
| 985 | 16.898 | 16.728 |
| 986 | 16.898 | 16.728 |
| 987 | 16.898 | 16.728 |
| 988 | 16.948 | 16.728 |
| 989 | 16.948 | 16.728 |
| 990 | 16.948 | 16.728 |
| 991 | 16.948 | 16.728 |
| 992 | 16.928 | 16.778 |
| 993 | 16.928 | 16.778 |
| 994 | 16.928 | 16.778 |
| 995 | 16.948 | 16.728 |
| 996 | 16.948 | 16.728 |
| 997 | 16.948 | 16.728 |
| 998 | 16.948 | 16.728 |
| 999 | 16.898 | 16.728 |
| 1000 | 16.898 | 16.728 |
| 1001 | 16.898 | 16.728 |
| 1002 | 16.848 | 16.707 |
| 1003 | 16.848 | 16.707 |
| 1004 | 16.848 | 16.707 |
| 1005 | 16.848 | 16.707 |
| 1006 | 16.878 | 16.707 |
| 1007 | 16.878 | 16.707 |
| 1008 | 16.878 | 16.707 |
| 1009 | 16.878 | 16.678 |
| 1010 | 16.878 | 16.678 |
| 1011 | 16.878 | 16.678 |
| 1012 | 16.878 | 16.678 |
| 1013 | 16.898 | 16.757 |
| 1014 | 16.898 | 16.757 |
| 1015 | 16.898 | 16.757 |
| 1016 | 16.848 | 16.678 |
| 1017 | 16.848 | 16.678 |
| 1018 | 16.848 | 16.678 |
| 1019 | 16.848 | 16.678 |
| 1020 | 16.878 | 16.778 |
| 1021 | 16.878 | 16.778 |
| 1022 | 16.878 | 16.778 |
| 1023 | 16.848 | 16.757 |
| 1024 | 16.848 | 16.757 |
| 1025 | 16.848 | 16.757 |
| 1026 | 16.848 | 16.757 |
| 1027 | 16.778 | 16.657 |
| 1028 | 16.778 | 16.657 |
| 1029 | 16.778 | 16.657 |
| 1030 | 16.848 | 16.757 |
| 1031 | 16.848 | 16.757 |
| 1032 | 16.848 | 16.757 |
| 1033 | 16.807 | 16.678 |
| 1034 | 16.807 | 16.678 |
| 1035 | 16.807 | 16.678 |
| 1036 | 16.807 | 16.678 |
| 1037 | 16.778 | 16.628 |
| 1038 | 16.778 | 16.628 |
| 1039 | 16.778 | 16.628 |
| 1040 | 16.757 | 16.657 |
| 1041 | 16.757 | 16.657 |
| 1042 | 16.757 | 16.657 |
| 1043 | 16.757 | 16.657 |
| 1044 | 16.757 | 16.657 |
| 1045 | 16.757 | 16.657 |
| 1046 | 16.757 | 16.657 |
| 1047 | 16.757 | 16.657 |
| 1048 | 16.757 | 16.657 |
| 1049 | 16.757 | 16.657 |
| 1050 | 16.757 | 16.657 |
| 1051 | 16.807 | 16.607 |
| 1052 | 16.807 | 16.607 |
| 1053 | 16.807 | 16.607 |
| 1054 | 16.757 | 16.657 |
| 1055 | 16.757 | 16.657 |
| 1056 | 16.757 | 16.657 |
| 1057 | 16.757 | 16.657 |
| 1058 | 16.828 | 16.707 |
| 1059 | 16.828 | 16.707 |
| 1060 | 16.828 | 16.707 |
| 1061 | 16.707 | 16.607 |
| 1062 | 16.707 | 16.607 |
| 1063 | 16.707 | 16.607 |
| 1064 | 16.707 | 16.607 |
| 1065 | 16.728 | 16.628 |
| 1066 | 16.728 | 16.628 |
| 1067 | 16.728 | 16.628 |
| 1068 | 16.757 | 16.657 |
| 1069 | 16.757 | 16.657 |
| 1070 | 16.757 | 16.657 |
| 1071 | 16.757 | 16.657 |
| 1072 | 16.707 | 16.607 |
| 1073 | 16.707 | 16.607 |
| 1074 | 16.707 | 16.607 |
| 1075 | 16.707 | 16.628 |
| 1076 | 16.707 | 16.628 |
| 1077 | 16.707 | 16.628 |
| 1078 | 16.707 | 16.628 |
| 1079 | 16.757 | 16.628 |
| 1080 | 16.757 | 16.628 |
| 1081 | 16.757 | 16.628 |
| 1082 | 16.728 | 16.678 |
| 1083 | 16.728 | 16.678 |
| 1084 | 16.728 | 16.678 |
| 1085 | 16.728 | 16.678 |
| 1086 | 16.678 | 16.607 |
| 1087 | 16.678 | 16.607 |
| 1088 | 16.678 | 16.607 |
| 1089 | 16.678 | 16.588 |
| 1090 | 16.678 | 16.588 |
| 1091 | 16.678 | 16.588 |
| 1092 | 16.678 | 16.588 |
| 1093 | 16.707 | 16.607 |
| 1094 | 16.707 | 16.607 |
| 1095 | 16.707 | 16.607 |
| 1096 | 16.678 | 16.607 |
| 1097 | 16.678 | 16.607 |
| 1098 | 16.678 | 16.607 |
| 1099 | 16.728 | 16.628 |
| 1100 | 16.728 | 16.628 |
| 1101 | 16.728 | 16.628 |
| 1102 | 16.728 | 16.628 |
| 1103 | 16.678 | 16.628 |
| 1104 | 16.678 | 16.628 |
| 1105 | 16.678 | 16.628 |
| 1106 | 16.707 | 16.607 |
| 1107 | 16.707 | 16.607 |
| 1108 | 16.707 | 16.607 |
| 1109 | 16.707 | 16.607 |
| 1110 | 16.678 | 16.588 |
| 1111 | 16.678 | 16.588 |
| 1112 | 16.678 | 16.588 |
| 1113 | 16.778 | 16.628 |
| 1114 | 16.778 | 16.628 |
| 1115 | 16.778 | 16.628 |
| 1116 | 16.778 | 16.628 |
| 1117 | 16.728 | 16.628 |
| 1118 | 16.728 | 16.628 |
| 1119 | 16.728 | 16.628 |
| 1120 | 16.707 | 16.607 |
| 1121 | 16.707 | 16.607 |
| 1122 | 16.707 | 16.607 |
| 1123 | 16.707 | 16.607 |
| 1124 | 16.707 | 16.607 |
| 1125 | 16.707 | 16.607 |
| 1126 | 16.707 | 16.607 |
| 1127 | 16.657 | 16.607 |
| 1128 | 16.657 | 16.607 |
| 1129 | 16.657 | 16.607 |
| 1130 | 16.657 | 16.607 |
| 1131 | 16.657 | 16.588 |
| 1132 | 16.657 | 16.588 |
| 1133 | 16.657 | 16.588 |
| 1134 | 16.628 | 16.537 |
| 1135 | 16.628 | 16.537 |
| 1136 | 16.628 | 16.537 |
| 1137 | 16.628 | 16.537 |
| 1138 | 16.657 | 16.537 |
| 1139 | 16.657 | 16.537 |
| 1140 | 16.657 | 16.537 |
| 1141 | 17.148 | 17.027 |
| 1142 | 17.148 | 17.027 |
| 1143 | 17.148 | 17.027 |
| 1144 | 17.148 | 17.027 |
| 1145 | 16.547 | 16.437 |
| 1146 | 16.547 | 16.437 |
| 1147 | 16.547 | 16.437 |
| 1148 | 16.628 | 16.557 |
| 1149 | 16.628 | 16.557 |
| 1150 | 16.628 | 16.557 |
| 1151 | 16.678 | 16.607 |
| 1152 | 16.678 | 16.607 |
| 1153 | 16.678 | 16.607 |
| 1154 | 16.678 | 16.628 |
| 1155 | 16.678 | 16.628 |
| 1156 | 16.678 | 16.628 |
| 1157 | 16.678 | 16.628 |
| 1158 | 16.607 | 16.537 |
| 1159 | 16.607 | 16.537 |
| 1160 | 16.607 | 16.537 |
| 1161 | 16.537 | 16.487 |
| 1162 | 16.537 | 16.487 |
| 1163 | 16.537 | 16.487 |
| 1164 | 16.537 | 16.487 |
| 1165 | 16.607 | 16.537 |
| 1166 | 16.607 | 16.537 |
| 1167 | 16.607 | 16.537 |
| 1168 | 16.678 | 16.628 |
| 1169 | 16.678 | 16.628 |
| 1170 | 16.678 | 16.628 |
| 1171 | 16.678 | 16.628 |
| 1172 | 16.807 | 16.707 |
| 1173 | 16.807 | 16.707 |
| 1174 | 16.807 | 16.707 |
| 1175 | 16.728 | 16.678 |
| 1176 | 16.728 | 16.678 |
| 1177 | 16.728 | 16.678 |
| 1178 | 16.728 | 16.678 |
| 1179 | 16.657 | 16.588 |
| 1180 | 16.657 | 16.588 |
| 1181 | 16.657 | 16.588 |
| 1182 | 16.878 | 16.807 |
| 1183 | 16.878 | 16.807 |
| 1184 | 16.878 | 16.807 |
| 1185 | 16.878 | 16.807 |
| 1186 | 17.048 | 16.978 |
| 1187 | 17.048 | 16.978 |
| 1188 | 17.048 | 16.978 |
| 1189 | 17.048 | 16.978 |
| 1190 | 17.048 | 16.978 |
| 1191 | 16.828 | 16.707 |
| 1192 | 16.828 | 16.707 |
| 1193 | 16.828 | 16.707 |
| 1194 | 16.678 | 16.607 |
| 1195 | 16.678 | 16.607 |
| 1196 | 16.678 | 16.607 |
| 1197 | 16.678 | 16.607 |
| 1198 | 16.807 | 16.678 |
| 1199 | 16.807 | 16.678 |
| 1200 | 16.807 | 16.678 |
| 1201 | 16.507 | 16.387 |
| 1202 | 16.507 | 16.387 |
| 1203 | 16.507 | 16.387 |
| 1204 | 16.507 | 16.387 |
| 1205 | 16.628 | 16.437 |
| 1206 | 16.628 | 16.437 |
| 1207 | 16.628 | 16.437 |
| 1208 | 16.707 | 16.537 |
| 1209 | 16.707 | 16.537 |
| 1210 | 16.707 | 16.537 |
| 1211 | 16.707 | 16.537 |
| 1212 | 16.757 | 16.657 |
| 1213 | 16.757 | 16.657 |
| 1214 | 16.757 | 16.657 |
| 1215 | 16.657 | 16.537 |
| 1216 | 16.657 | 16.537 |
| 1217 | 16.657 | 16.537 |
| 1218 | 16.657 | 16.537 |
| 1219 | 17.587 | 17.468 |
| 1220 | 17.587 | 17.468 |
| 1221 | 17.587 | 17.468 |
| 1222 | 16.537 | 16.487 |
| 1223 | 16.537 | 16.487 |
| 1224 | 16.537 | 16.487 |
| 1225 | 16.537 | 16.487 |
| 1226 | 16.628 | 16.557 |
| 1227 | 16.628 | 16.557 |
| 1228 | 16.628 | 16.557 |
| 1229 | 16.628 | 16.537 |
| 1230 | 16.628 | 16.537 |
| 1231 | 16.628 | 16.537 |
| 1232 | 16.628 | 16.537 |
| 1233 | 16.728 | 16.657 |
| 1234 | 16.728 | 16.657 |
| 1235 | 16.728 | 16.657 |
| 1236 | 16.678 | 16.607 |
| 1237 | 16.678 | 16.607 |
| 1238 | 16.678 | 16.607 |
| 1239 | 16.678 | 16.607 |
| 1240 | 16.807 | 16.678 |
| 1241 | 16.807 | 16.678 |
| 1242 | 16.807 | 16.678 |
| 1243 | 16.628 | 16.557 |
| 1244 | 16.628 | 16.557 |
| 1245 | 16.628 | 16.557 |
| 1246 | 16.628 | 16.557 |
| 1247 | 16.628 | 16.537 |
| 1248 | 16.628 | 16.537 |
| 1249 | 16.628 | 16.537 |
| 1250 | 16.628 | 16.557 |
| 1251 | 16.628 | 16.557 |
| 1252 | 16.628 | 16.557 |
| 1253 | 16.628 | 16.557 |
| 1254 | 16.588 | 16.487 |
| 1255 | 16.588 | 16.487 |
| 1256 | 16.588 | 16.487 |
| 1257 | 16.707 | 16.628 |
| 1258 | 16.707 | 16.628 |
| 1259 | 16.707 | 16.628 |
| 1260 | 16.707 | 16.628 |
| 1261 | 16.588 | 16.537 |
| 1262 | 16.588 | 16.537 |
| 1263 | 16.588 | 16.537 |
| 1264 | 16.838 | 16.728 |
| 1265 | 16.838 | 16.728 |
| 1266 | 16.838 | 16.728 |
| 1267 | 16.838 | 16.728 |
| 1268 | 16.778 | 16.678 |
| 1269 | 16.778 | 16.678 |
| 1270 | 16.778 | 16.678 |
| 1271 | 16.757 | 16.678 |
| 1272 | 16.757 | 16.678 |
| 1273 | 16.757 | 16.678 |
| 1274 | 16.757 | 16.678 |
| 1275 | 16.757 | 16.657 |
| 1276 | 16.757 | 16.657 |
| 1277 | 16.757 | 16.657 |
| 1278 | 16.807 | 16.678 |
| 1279 | 16.807 | 16.678 |
| 1280 | 16.807 | 16.678 |
| 1281 | 16.807 | 16.678 |
| 1282 | 16.707 | 16.628 |
| 1283 | 16.707 | 16.628 |
| 1284 | 16.707 | 16.628 |
| 1285 | 16.807 | 16.707 |
| 1286 | 16.807 | 16.707 |
| 1287 | 16.807 | 16.707 |
| 1288 | 16.807 | 16.707 |
| 1289 | 16.878 | 16.828 |
| 1290 | 16.878 | 16.828 |
| 1291 | 16.878 | 16.828 |
| 1292 | 17.098 | 16.998 |
| 1293 | 17.098 | 16.998 |
| 1294 | 17.098 | 16.998 |
| 1295 | 17.098 | 16.998 |
| 1296 | 17.198 | 17.098 |
| 1297 | 17.198 | 17.098 |
| 1298 | 17.198 | 17.098 |
| 1299 | 17.198 | 17.098 |
| 1300 | 17.148 | 17.027 |
| 1301 | 17.148 | 17.027 |
| 1302 | 17.148 | 17.027 |
| 1303 | 17.067 | 16.998 |
| 1304 | 17.067 | 16.998 |
| 1305 | 17.067 | 16.998 |
| 1306 | 17.067 | 16.998 |
| 1307 | 17.057 | 16.948 |
| 1308 | 17.057 | 16.948 |
| 1309 | 17.057 | 16.948 |
| 1310 | 17.148 | 16.998 |
| 1311 | 17.148 | 16.998 |
| 1312 | 17.148 | 16.998 |
| 1313 | 17.148 | 16.998 |
| 1314 | 17.198 | 17.027 |
| 1315 | 17.198 | 17.027 |
| 1316 | 17.198 | 17.027 |
| 1317 | 16.728 | 16.588 |
| 1318 | 16.728 | 16.588 |
| 1319 | 16.728 | 16.588 |
| 1320 | 16.728 | 16.588 |
| 1321 | 16.778 | 16.678 |
| 1322 | 16.778 | 16.678 |
| 1323 | 16.778 | 16.678 |
| 1324 | 16.928 | 16.828 |
| 1325 | 16.928 | 16.828 |
| 1326 | 16.928 | 16.828 |
| 1327 | 16.928 | 16.557 |
| 1328 | 16.707 | 16.557 |
| 1329 | 16.707 | 16.557 |
| 1330 | 16.707 | 16.557 |
| 1331 | 16.978 | 16.828 |
| 1332 | 16.978 | 16.828 |
| 1333 | 16.978 | 16.828 |
| 1334 | 16.898 | 16.757 |
| 1335 | 16.898 | 16.757 |
| 1336 | 16.898 | 16.757 |
| 1337 | 16.898 | 16.757 |
| 1338 | 16.807 | 16.628 |
| 1339 | 16.807 | 16.628 |
| 1340 | 16.807 | 16.628 |
| 1341 | 16.828 | 16.678 |
| 1342 | 16.828 | 16.678 |
| 1343 | 16.828 | 16.678 |
| 1344 | 16.828 | 16.678 |
| 1345 | 16.807 | 16.678 |
| 1346 | 16.807 | 16.678 |
| 1347 | 16.807 | 16.678 |
| 1348 | 16.757 | 16.657 |
| 1349 | 16.757 | 16.657 |
| 1350 | 16.757 | 16.657 |
| 1351 | 16.757 | 16.657 |
| 1352 | 16.807 | 16.657 |
| 1353 | 16.807 | 16.657 |
| 1354 | 16.807 | 16.657 |
| 1355 | 16.807 | 16.657 |
| 1356 | 16.757 | 16.678 |
| 1357 | 16.757 | 16.678 |
| 1358 | 16.757 | 16.678 |
| 1359 | 16.807 | 16.707 |
| 1360 | 16.807 | 16.707 |
| 1361 | 16.807 | 16.707 |
| 1362 | 16.807 | 16.707 |
| 1363 | 16.757 | 16.657 |
| 1364 | 16.757 | 16.657 |
| 1365 | 16.757 | 16.657 |
| 1366 | 16.778 | 16.607 |
| 1367 | 16.778 | 16.607 |
| 1368 | 16.778 | 16.607 |
| 1369 | 16.778 | 16.607 |
| 1370 | 16.707 | 16.607 |
| 1371 | 16.707 | 16.607 |
| 1372 | 16.707 | 16.607 |
| 1373 | 16.707 | 16.557 |
| 1374 | 16.707 | 16.557 |
| 1375 | 16.707 | 16.557 |
| 1376 | 16.707 | 16.557 |
| 1377 | 16.678 | 16.588 |
| 1378 | 16.678 | 16.588 |
| 1379 | 16.678 | 16.588 |
| 1380 | 16.607 | 16.507 |
| 1381 | 16.607 | 16.507 |
| 1382 | 16.607 | 16.507 |
| 1383 | 16.607 | 16.507 |
| 1384 | 16.588 | 16.437 |
| 1385 | 16.588 | 16.437 |
| 1386 | 16.588 | 16.437 |
| 1387 | 16.657 | 16.588 |
| 1388 | 16.657 | 16.588 |
| 1389 | 16.657 | 16.588 |
| 1390 | 16.657 | 16.588 |
| 1391 | 16.707 | 16.657 |
| 1392 | 16.707 | 16.657 |
| 1393 | 16.707 | 16.657 |
| 1394 | 16.878 | 16.778 |
| 1395 | 16.878 | 16.778 |
| 1396 | 16.878 | 16.778 |
| 1397 | 16.878 | 16.778 |
| 1398 | 16.817 | 16.678 |
| 1399 | 16.817 | 16.678 |
| 1400 | 16.817 | 16.678 |
| 1401 | 16.778 | 16.678 |
| 1402 | 16.778 | 16.678 |
| 1403 | 16.778 | 16.678 |
| 1404 | 16.957 | 16.878 |
| 1405 | 16.957 | 16.878 |
| 1406 | 16.957 | 16.878 |
| 1407 | 16.957 | 16.878 |
| 1408 | 17.198 | 17.098 |
| 1409 | 17.198 | 17.098 |
| 1410 | 17.198 | 17.098 |
| 1411 | 17.198 | 17.098 |
| 1412 | 17.198 | 17.098 |
| 1413 | 17.198 | 17.098 |
| 1414 | 17.048 | 16.878 |
| 1415 | 17.048 | 16.878 |
| 1416 | 17.048 | 16.878 |
| 1417 | 17.048 | 16.878 |
| 1418 | 16.807 | 16.408 |
| 1419 | 16.807 | 16.408 |
| 1420 | 16.807 | 16.408 |
| 1421 | 16.967 | 16.807 |
| 1422 | 16.967 | 16.807 |
| 1423 | 16.967 | 16.807 |
| 1424 | 16.967 | 16.807 |
| 1425 | 16.657 | 16.537 |
| 1426 | 16.657 | 16.537 |
| 1427 | 16.657 | 16.537 |
| 1428 | 16.657 | 16.537 |
| 1429 | 16.778 | 16.678 |
| 1430 | 16.778 | 16.678 |
| 1431 | 16.778 | 16.678 |
| 1432 | 16.807 | 16.678 |
| 1433 | 16.807 | 16.678 |
| 1434 | 16.807 | 16.678 |
| 1435 | 16.807 | 16.678 |
| 1436 | 16.807 | 16.707 |
| 1437 | 16.807 | 16.707 |
| 1438 | 16.807 | 16.707 |
| 1439 | 16.807 | 16.678 |
| 1440 | 16.807 | 16.678 |
| 1441 | 16.807 | 16.678 |
| 1442 | 16.807 | 16.678 |
| 1443 | 16.757 | 16.628 |
| 1444 | 16.757 | 16.628 |
| 1445 | 16.757 | 16.628 |
| 1446 | 16.828 | 16.728 |
| 1447 | 16.828 | 16.728 |
| 1448 | 16.828 | 16.728 |
| 1449 | 16.828 | 16.728 |
| 1450 | 16.507 | 16.387 |
| 1451 | 16.507 | 16.387 |
| 1452 | 16.507 | 16.387 |
| 1453 | 16.828 | 16.707 |
| 1454 | 16.828 | 16.707 |
| 1455 | 16.828 | 16.707 |
| 1456 | 16.828 | 16.707 |
| 1457 | 16.807 | 16.707 |
| 1458 | 16.807 | 16.707 |
| 1459 | 16.807 | 16.707 |
| 1460 | 17.337 | 17.248 |
| 1461 | 17.337 | 17.248 |
| 1462 | 17.337 | 17.248 |
| 1463 | 17.337 | 17.248 |
| 1464 | 16.848 | 16.657 |
| 1465 | 16.848 | 16.657 |
| 1466 | 16.848 | 16.657 |
| 1467 | 16.757 | 16.628 |
| 1468 | 16.757 | 16.628 |
| 1469 | 16.757 | 16.628 |
| 1470 | 16.828 | 16.707 |
| 1471 | 16.828 | 16.707 |
| 1472 | 16.828 | 16.707 |
| 1473 | 16.828 | 16.707 |
| 1474 | 17.287 | 17.148 |
| 1475 | 17.287 | 17.148 |
| 1476 | 17.287 | 17.148 |
| 1477 | 16.458 | 16.268 |
| 1478 | 16.458 | 16.268 |
| 1479 | 16.458 | 16.268 |
| 1480 | 16.458 | 16.268 |
| 1481 | 17.248 | 17.148 |
| 1482 | 17.248 | 17.148 |
| 1483 | 17.248 | 17.148 |
| 1484 | 16.828 | 16.678 |
| 1485 | 16.828 | 16.678 |
| 1486 | 16.828 | 16.678 |
| 1487 | 16.828 | 16.678 |
| 1488 | 16.878 | 16.778 |
| 1489 | 16.878 | 16.778 |
| 1490 | 16.878 | 16.778 |
| 1491 | 16.878 | 16.707 |
| 1492 | 16.828 | 16.707 |
| 1493 | 16.828 | 16.707 |
| 1494 | 16.828 | 16.707 |
| 1495 | 16.998 | 16.778 |
| 1496 | 16.998 | 16.778 |
| 1497 | 16.998 | 16.778 |
| 1498 | 16.998 | 16.778 |
| 1499 | 15.268 | 15.087 |
| 1500 | 15.268 | 15.087 |
| 1501 | 15.268 | 15.087 |
| 1502 | 17.267 | 17.148 |
| 1503 | 17.267 | 17.148 |
| 1504 | 17.267 | 17.148 |
| 1505 | 17.267 | 17.217 |
| 1506 | 17.267 | 17.217 |
| 1507 | 17.267 | 17.217 |
| 1508 | 17.267 | 17.217 |
| 1509 | 17.067 | 17.027 |
| 1510 | 17.067 | 17.027 |
| 1511 | 17.067 | 17.027 |
| 1512 | 17.048 | 16.978 |
| 1513 | 17.048 | 16.978 |
| 1514 | 17.048 | 16.978 |
| 1515 | 17.117 | 17.027 |
| 1516 | 17.117 | 17.027 |
| 1517 | 17.117 | 17.027 |
| 1518 | 17.117 | 17.027 |
| 1519 | 16.898 | 16.828 |
| 1520 | 16.898 | 16.828 |
| 1521 | 16.898 | 16.828 |
| 1522 | 16.898 | 16.828 |
| 1523 | 16.337 | 16.218 |
| 1524 | 16.337 | 16.218 |
| 1525 | 16.337 | 16.218 |
| 1526 | 16.998 | 16.898 |
| 1527 | 16.998 | 16.898 |
| 1528 | 16.998 | 16.898 |
| 1529 | 16.998 | 16.898 |
| 1530 | 16.957 | 16.878 |
| 1531 | 16.957 | 16.878 |
| 1532 | 16.957 | 16.878 |
| 1533 | 17.027 | 16.928 |
| 1534 | 17.027 | 16.928 |
| 1535 | 17.027 | 16.928 |
| 1536 | 17.027 | 16.928 |
| 1537 | 17.267 | 17.167 |
| 1538 | 17.267 | 17.167 |
| 1539 | 17.267 | 17.167 |
| 1540 | 17.267 | 17.148 |
| 1541 | 17.267 | 17.148 |
| 1542 | 17.267 | 17.148 |
| 1543 | 17.267 | 17.148 |
| 1544 | 17.287 | 17.217 |
| 1545 | 17.287 | 17.217 |
| 1546 | 17.287 | 17.217 |
| 1547 | 17.287 | 17.217 |
| 1548 | 17.248 | 17.098 |
| 1549 | 17.248 | 17.098 |
| 1550 | 17.248 | 17.098 |
| 1551 | 16.948 | 16.807 |
| 1552 | 16.948 | 16.807 |
| 1553 | 16.948 | 16.807 |
| 1554 | 16.948 | 16.807 |
| 1555 | 16.657 | 16.487 |
| 1556 | 16.657 | 16.487 |
| 1557 | 16.657 | 16.487 |
| 1558 | 16.898 | 16.707 |
| 1559 | 16.898 | 16.707 |
| 1560 | 16.898 | 16.707 |
| 1561 | 16.898 | 16.707 |
| 1562 | 17.248 | 17.048 |
| 1563 | 17.248 | 17.048 |
| 1564 | 17.248 | 17.048 |
| 1565 | 17.287 | 17.117 |
| 1566 | 17.287 | 17.117 |
| 1567 | 17.287 | 17.117 |
| 1568 | 17.287 | 17.117 |
| 1569 | 18.028 | 17.828 |
| 1570 | 18.028 | 17.828 |
| 1571 | 18.028 | 17.828 |
| 1572 | 18.028 | 17.828 |
| 1573 | 18.298 | 17.997 |
| 1574 | 18.298 | 17.997 |
| 1575 | 18.298 | 17.997 |
| 1576 | 18.317 | 18.028 |
| 1577 | 18.317 | 18.028 |
| 1578 | 18.317 | 18.028 |
| 1579 | 18.317 | 18.097 |
| 1580 | 18.467 | 18.097 |
| 1581 | 18.467 | 18.097 |
| 1582 | 18.467 | 18.097 |
| 1583 | 17.807 | 17.508 |
| 1584 | 17.807 | 17.508 |
| 1585 | 17.807 | 17.508 |
| 1586 | 17.807 | 17.508 |
| 1587 | 17.468 | 17.148 |
| 1588 | 17.468 | 17.148 |
| 1589 | 17.468 | 17.148 |
| 1590 | 17.198 | 16.928 |
| 1591 | 17.198 | 16.928 |
| 1592 | 17.198 | 16.928 |
| 1593 | 17.198 | 16.928 |
| 1594 | 16.458 | 16.148 |
| 1595 | 16.458 | 16.148 |
| 1596 | 16.458 | 16.148 |
| 1597 | 16.707 | 16.437 |
| 1598 | 16.707 | 16.437 |
| 1599 | 16.707 | 16.437 |
| 1600 | 16.707 | 16.437 |
| 1601 | 16.757 | 16.588 |
| 1602 | 16.757 | 16.588 |
| 1603 | 16.757 | 16.588 |
| 1604 | 16.898 | 16.728 |
| 1605 | 16.898 | 16.728 |
| 1606 | 16.898 | 16.728 |
| 1607 | 16.898 | 16.728 |
| 1608 | 16.898 | 16.757 |
| 1609 | 16.898 | 16.757 |
| 1610 | 16.898 | 16.757 |
| 1611 | 16.828 | 16.678 |
| 1612 | 16.828 | 16.678 |
| 1613 | 16.828 | 16.678 |
| 1614 | 16.828 | 16.678 |
| 1615 | 16.948 | 16.778 |
| 1616 | 16.948 | 16.778 |
| 1617 | 16.948 | 16.778 |
| 1618 | 16.507 | 16.218 |
| 1619 | 16.507 | 16.218 |
| 1620 | 16.507 | 16.218 |
| 1621 | 16.507 | 16.218 |
| 1622 | 15.948 | 15.728 |
| 1623 | 15.948 | 15.728 |
| 1624 | 15.948 | 15.728 |
| 1625 | 16.098 | 15.877 |
| 1626 | 16.098 | 15.877 |
| 1627 | 16.098 | 15.877 |
| 1628 | 16.098 | 15.877 |
| 1629 | 16.507 | 16.387 |
| 1630 | 16.507 | 16.387 |
| 1631 | 16.507 | 16.387 |
| 1632 | 16.458 | 16.368 |
| 1633 | 16.458 | 16.368 |
| 1634 | 16.458 | 16.368 |
| 1635 | 16.458 | 16.368 |
| 1636 | 16.898 | 16.778 |
| 1637 | 16.898 | 16.778 |
| 1638 | 16.898 | 16.778 |
| 1639 | 16.898 | 16.778 |
| 1640 | 16.878 | 16.807 |
| 1641 | 16.878 | 16.807 |
| 1642 | 16.878 | 16.807 |
| 1643 | 17.878 | 17.807 |
| 1644 | 17.878 | 17.807 |
| 1645 | 17.878 | 17.807 |
| 1646 | 17.878 | 17.807 |
| 1647 | 18.028 | 17.928 |
| 1648 | 18.028 | 17.928 |
| 1649 | 18.028 | 17.928 |
| 1650 | 18.078 | 17.947 |
| 1651 | 18.078 | 17.947 |
| 1652 | 18.078 | 17.947 |
| 1653 | 18.078 | 17.947 |
| 1654 | 18.147 | 17.997 |
| 1655 | 18.147 | 17.997 |
| 1656 | 18.147 | 17.997 |
| 1657 | 17.418 | 17.217 |
| 1658 | 17.418 | 17.217 |
| 1659 | 17.418 | 17.217 |
| 1660 | 17.418 | 17.217 |
| 1661 | 17.487 | 17.248 |
| 1662 | 17.487 | 17.248 |
| 1663 | 17.487 | 17.248 |
| 1664 | 17.487 | 17.248 |
| 1665 | 17.487 | 17.248 |
| 1666 | 17.487 | 17.248 |
| 1667 | 17.487 | 17.248 |
| 1668 | 17.418 | 17.198 |
| 1669 | 17.418 | 17.198 |
| 1670 | 17.418 | 17.198 |
| 1671 | 17.537 | 17.287 |
| 1672 | 17.537 | 17.287 |
| 1673 | 17.537 | 17.287 |
| 1674 | 17.537 | 17.287 |
| 1675 | 17.248 | 16.978 |
| 1676 | 17.248 | 16.978 |
| 1677 | 17.248 | 16.978 |
| 1678 | 17.098 | 16.878 |
| 1679 | 17.098 | 16.878 |
| 1680 | 17.098 | 16.878 |
| 1681 | 17.098 | 16.878 |
| 1682 | 17.048 | 16.828 |
| 1683 | 17.048 | 16.828 |
| 1684 | 17.048 | 16.828 |
| 1685 | 17.048 | 16.828 |
| 1686 | 17.048 | 16.828 |
| 1687 | 17.048 | 16.828 |
| 1688 | 17.048 | 16.828 |
| 1689 | 16.978 | 16.778 |
| 1690 | 16.978 | 16.778 |
| 1691 | 16.978 | 16.778 |
| 1692 | 16.978 | 16.778 |
| 1693 | 16.948 | 16.757 |
| 1694 | 16.948 | 16.757 |
| 1695 | 16.948 | 16.757 |
| 1696 | 16.807 | 16.607 |
| 1697 | 16.807 | 16.607 |
| 1698 | 16.807 | 16.607 |
| 1699 | 16.807 | 16.607 |
| 1700 | 16.878 | 16.707 |
| 1701 | 16.878 | 16.707 |
| 1702 | 16.878 | 16.707 |
| 1703 | 16.628 | 16.458 |
| 1704 | 16.628 | 16.458 |
| 1705 | 16.628 | 16.458 |
| 1706 | 16.628 | 16.458 |
| 1707 | 16.728 | 16.588 |
| 1708 | 16.728 | 16.588 |
| 1709 | 16.728 | 16.588 |
| 1710 | 16.537 | 16.437 |
| 1711 | 16.537 | 16.437 |
| 1712 | 16.537 | 16.437 |
| 1713 | 16.537 | 16.437 |
| 1714 | 16.638 | 16.537 |
| 1715 | 16.638 | 16.537 |
| 1716 | 16.638 | 16.537 |
| 1717 | 16.657 | 16.537 |
| 1718 | 16.657 | 16.537 |
| 1719 | 16.657 | 16.537 |
| 1720 | 16.657 | 16.537 |
| 1721 | 16.657 | 16.557 |
| 1722 | 16.657 | 16.557 |
| 1723 | 16.657 | 16.557 |
| 1724 | 16.628 | 16.537 |
| 1725 | 16.628 | 16.537 |
| 1726 | 16.628 | 16.537 |
| 1727 | 16.597 | 16.537 |
| 1728 | 16.597 | 16.537 |
| 1729 | 16.597 | 16.537 |
| 1730 | 16.597 | 16.537 |
| 1731 | 16.588 | 16.507 |
| 1732 | 16.588 | 16.507 |
| 1733 | 16.588 | 16.507 |
| 1734 | 16.588 | 16.507 |
| 1735 | 16.547 | 16.487 |
| 1736 | 16.547 | 16.487 |
| 1737 | 16.547 | 16.487 |
| 1738 | 16.507 | 16.437 |
| 1739 | 16.507 | 16.437 |
| 1740 | 16.507 | 16.437 |
| 1741 | 16.507 | 16.437 |
| 1742 | 16.487 | 16.408 |
| 1743 | 16.487 | 16.408 |
| 1744 | 16.487 | 16.408 |
| 1745 | 16.458 | 16.368 |
| 1746 | 16.458 | 16.368 |
| 1747 | 16.458 | 16.368 |
| 1748 | 16.458 | 16.368 |
| 1749 | 16.387 | 16.318 |
| 1750 | 16.387 | 16.318 |
| 1751 | 16.387 | 16.318 |
| 1752 | 16.308 | 16.237 |
| 1753 | 16.308 | 16.237 |
| 1754 | 16.308 | 16.237 |
| 1755 | 16.308 | 16.237 |
| 1756 | 16.268 | 16.187 |
| 1757 | 16.268 | 16.187 |
| 1758 | 16.268 | 16.187 |
| 1759 | 16.218 | 16.148 |
| 1760 | 16.218 | 16.148 |
| 1761 | 16.218 | 16.148 |
| 1762 | 16.218 | 16.148 |
| 1763 | 16.187 | 16.148 |
| 1764 | 16.187 | 16.148 |
| 1765 | 16.187 | 16.148 |
| 1766 | 16.187 | 16.148 |
| 1767 | 16.168 | 16.098 |
| 1768 | 16.168 | 16.098 |
| 1769 | 16.168 | 16.098 |
| 1770 | 16.118 | 16.048 |
| 1771 | 16.118 | 16.048 |
| 1772 | 16.118 | 16.048 |
| 1773 | 16.118 | 16.048 |
| 1774 | 16.068 | 15.998 |
| 1775 | 16.068 | 15.998 |
| 1776 | 16.068 | 15.998 |
| 1777 | 16.048 | 15.948 |
| 1778 | 16.048 | 15.948 |
| 1779 | 16.048 | 15.948 |
| 1780 | 16.048 | 15.948 |
| 1781 | 16.018 | 15.898 |
| 1782 | 16.018 | 15.898 |
| 1783 | 16.018 | 15.898 |
| 1784 | 15.967 | 15.848 |
| 1785 | 15.967 | 15.848 |
| 1786 | 15.967 | 15.848 |
| 1787 | 15.967 | 15.848 |
| 1788 | 15.948 | 15.848 |
| 1789 | 15.948 | 15.848 |
| 1790 | 15.948 | 15.848 |
| 1791 | 15.948 | 15.848 |
| 1792 | 15.948 | 15.848 |
| 1793 | 15.898 | 15.798 |
| 1794 | 15.898 | 15.798 |
| 1795 | 15.898 | 15.798 |
| 1796 | 15.877 | 15.748 |
| 1797 | 15.877 | 15.748 |
| 1798 | 15.877 | 15.748 |
| 1799 | 15.877 | 15.748 |
| 1800 | 15.848 | 15.728 |
| 1801 | 15.848 | 15.728 |
| 1802 | 15.848 | 15.728 |
| 1803 | 15.827 | 15.708 |
| 1804 | 15.827 | 15.708 |
| 1805 | 15.827 | 15.708 |
| 1806 | 15.827 | 15.708 |
| 1807 | 15.798 | 15.657 |
| 1808 | 15.798 | 15.657 |
| 1809 | 15.798 | 15.657 |
| 1810 | 15.777 | 15.607 |
| 1811 | 15.777 | 15.607 |
| 1812 | 15.777 | 15.607 |
| 1813 | 15.777 | 15.607 |
| 1814 | 15.728 | 15.607 |
| 1815 | 15.728 | 15.607 |
| 1816 | 15.728 | 15.607 |
| 1817 | 15.728 | 15.557 |
| 1818 | 15.728 | 15.557 |
| 1819 | 15.728 | 15.557 |
| 1820 | 15.728 | 15.557 |
| 1821 | 15.708 | 15.528 |
| 1822 | 15.708 | 15.528 |
| 1823 | 15.708 | 15.528 |
| 1824 | 15.678 | 15.507 |
| 1825 | 15.678 | 15.507 |
| 1826 | 15.678 | 15.507 |
| 1827 | 15.678 | 15.507 |
| 1828 | 15.628 | 15.457 |
| 1829 | 15.628 | 15.457 |
| 1830 | 15.628 | 15.457 |
| 1831 | 15.628 | 15.407 |
| 1832 | 15.628 | 15.407 |
| 1833 | 15.628 | 15.407 |
| 1834 | 15.628 | 15.407 |
| 1835 | 15.578 | 15.407 |
| 1836 | 15.578 | 15.407 |
| 1837 | 15.578 | 15.407 |
| 1838 | 15.578 | 15.357 |
| 1839 | 15.578 | 15.357 |
| 1840 | 15.578 | 15.357 |
| 1841 | 15.578 | 15.357 |
| 1842 | 15.528 | 15.357 |
| 1843 | 15.528 | 15.357 |
| 1844 | 15.528 | 15.357 |
| 1845 | 15.528 | 15.307 |
| 1846 | 15.528 | 15.307 |
| 1847 | 15.528 | 15.307 |
| 1848 | 15.528 | 15.307 |
| 1849 | 15.507 | 15.307 |
| 1850 | 15.507 | 15.307 |
| 1851 | 15.507 | 15.307 |
| 1852 | 15.507 | 15.307 |
| 1853 | 15.488 | 15.268 |
| 1854 | 15.488 | 15.268 |
| 1855 | 15.488 | 15.268 |
| 1856 | 15.457 | 15.238 |
| 1857 | 15.457 | 15.238 |
| 1858 | 15.457 | 15.238 |
| 1859 | 15.438 | 15.188 |
| 1860 | 15.438 | 15.188 |
| 1861 | 15.438 | 15.188 |
| 1862 | 15.438 | 15.188 |
| 1863 | 15.438 | 15.188 |
| 1864 | 15.438 | 15.188 |
| 1865 | 15.438 | 15.188 |
| 1866 | 15.438 | 15.188 |
| 1867 | 15.388 | 15.168 |
| 1868 | 15.388 | 15.168 |
| 1869 | 15.388 | 15.168 |
| 1870 | 15.357 | 15.118 |
| 1871 | 15.357 | 15.118 |
| 1872 | 15.357 | 15.118 |
| 1873 | 15.357 | 15.118 |
| 1874 | 15.338 | 15.118 |
| 1875 | 15.338 | 15.118 |
| 1876 | 15.338 | 15.118 |
| 1877 | 15.338 | 15.118 |
| 1878 | 15.307 | 15.087 |
| 1879 | 15.307 | 15.087 |
| 1880 | 15.307 | 15.087 |
| 1881 | 15.288 | 15.047 |
| 1882 | 15.288 | 15.047 |
| 1883 | 15.288 | 15.047 |
| 1884 | 15.288 | 15.047 |
| 1885 | 15.288 | 15.018 |
| 1886 | 15.288 | 15.018 |
| 1887 | 15.288 | 15.018 |
| 1888 | 15.238 | 14.998 |
| 1889 | 15.238 | 14.998 |
| 1890 | 15.238 | 14.998 |
| 1891 | 15.238 | 14.998 |
| 1892 | 15.238 | 14.948 |
| 1893 | 15.238 | 14.948 |
| 1894 | 15.238 | 14.948 |
| 1895 | 15.188 | 14.948 |
| 1896 | 15.188 | 14.948 |
| 1897 | 15.188 | 14.948 |
| 1898 | 15.188 | 14.918 |
| 1899 | 15.188 | 14.918 |
| 1900 | 15.188 | 14.918 |
| 1901 | 15.168 | 14.918 |
| 1902 | 15.168 | 14.918 |
| 1903 | 15.168 | 14.918 |
| 1904 | 15.168 | 14.918 |
| 1905 | 15.137 | 14.848 |
| 1906 | 15.137 | 14.848 |
| 1907 | 15.137 | 14.848 |
| 1908 | 15.137 | 14.848 |
| 1909 | 15.137 | 14.848 |
| 1910 | 15.137 | 14.848 |
| 1911 | 15.137 | 14.848 |
| 1912 | 15.087 | 14.798 |
| 1913 | 15.087 | 14.798 |
| 1914 | 15.087 | 14.798 |
| 1915 | 15.087 | 14.798 |
| 1916 | 15.068 | 14.748 |
| 1917 | 15.068 | 14.748 |
| 1918 | 15.068 | 14.748 |
| 1919 | 15.047 | 14.777 |
| 1920 | 15.047 | 14.777 |
| 1921 | 15.047 | 14.777 |
| 1922 | 15.047 | 14.777 |
| 1923 | 15.018 | 14.698 |
| 1924 | 15.018 | 14.698 |
| 1925 | 15.018 | 14.698 |
| 1926 | 14.998 | 14.698 |
| 1927 | 14.998 | 14.698 |
| 1928 | 14.998 | 14.698 |
| 1929 | 14.998 | 14.698 |
| 1930 | 14.998 | 14.658 |
| 1931 | 14.998 | 14.658 |
| 1932 | 14.998 | 14.658 |
| 1933 | 14.948 | 14.608 |
| 1934 | 14.948 | 14.608 |
| 1935 | 14.948 | 14.608 |
| 1936 | 14.948 | 14.608 |
| 1937 | 14.918 | 14.608 |
| 1938 | 14.918 | 14.608 |
| 1939 | 14.918 | 14.608 |
| 1940 | 14.918 | 14.608 |
| 1941 | 14.898 | 14.558 |
| 1942 | 14.898 | 14.558 |
| 1943 | 14.898 | 14.558 |
| 1944 | 14.878 | 14.527 |
| 1945 | 14.878 | 14.527 |
| 1946 | 14.878 | 14.527 |
| 1947 | 14.848 | 14.508 |
| 1948 | 14.848 | 14.508 |
| 1949 | 14.848 | 14.508 |
| 1950 | 14.848 | 14.508 |
| 1951 | 14.848 | 14.458 |
| 1952 | 14.848 | 14.458 |
| 1953 | 14.848 | 14.458 |
| 1954 | 14.798 | 14.478 |
| 1955 | 14.798 | 14.478 |
| 1956 | 14.798 | 14.478 |
| 1957 | 14.798 | 14.478 |
| 1958 | 14.777 | 14.408 |
| 1959 | 14.777 | 14.408 |
| 1960 | 14.777 | 14.408 |
| 1961 | 14.748 | 14.358 |
| 1962 | 14.748 | 14.358 |
| 1963 | 14.748 | 14.358 |
| 1964 | 14.748 | 14.358 |
| 1965 | 14.748 | 14.358 |
| 1966 | 14.748 | 14.358 |
| 1967 | 14.748 | 14.358 |
| 1968 | 14.698 | 14.338 |
| 1969 | 14.698 | 14.338 |
| 1970 | 14.698 | 14.338 |
| 1971 | 14.698 | 14.338 |
| 1972 | 14.698 | 14.288 |
| 1973 | 14.698 | 14.288 |
| 1974 | 14.698 | 14.288 |
| 1975 | 14.698 | 14.288 |
| 1976 | 14.658 | 14.238 |
| 1977 | 14.658 | 14.238 |
| 1978 | 14.658 | 14.238 |
| 1979 | 14.658 | 14.218 |
| 1980 | 14.658 | 14.218 |
| 1981 | 14.658 | 14.218 |
| 1982 | 14.658 | 14.218 |
| 1983 | 14.627 | 14.168 |
| 1984 | 14.627 | 14.168 |
| 1985 | 14.627 | 14.168 |
| 1986 | 14.608 | 14.118 |
| 1987 | 14.608 | 14.118 |
| 1988 | 14.608 | 14.118 |
| 1989 | 14.608 | 14.118 |
| 1990 | 14.558 | 14.088 |
| 1991 | 14.558 | 14.088 |
| 1992 | 14.558 | 14.088 |
| 1993 | 14.558 | 14.068 |
| 1994 | 14.558 | 14.068 |
| 1995 | 14.558 | 14.068 |
| 1996 | 14.558 | 14.068 |
| 1997 | 14.527 | 14.018 |
| 1998 | 14.527 | 14.018 |
| 1999 | 14.527 | 14.018 |
| 2000 | 14.508 | 13.968 |
| 2001 | 14.508 | 13.968 |
| 2002 | 14.508 | 13.968 |
| 2003 | 14.508 | 13.968 |
| 2004 | 14.478 | 13.947 |
| 2005 | 14.478 | 13.947 |
| 2006 | 14.478 | 13.947 |
| 2007 | 14.458 | 13.918 |
| 2008 | 14.458 | 13.918 |
| 2009 | 14.458 | 13.918 |
| 2010 | 14.458 | 13.918 |
| 2011 | 14.438 | 13.868 |
| 2012 | 14.438 | 13.868 |
| 2013 | 14.438 | 13.868 |
| 2014 | 14.408 | 13.797 |
| 2015 | 14.408 | 13.797 |
| 2016 | 14.408 | 13.797 |
| 2017 | 14.408 | 13.797 |
| 2018 | 14.388 | 13.797 |
| 2019 | 14.388 | 13.797 |
| 2020 | 14.388 | 13.797 |
| 2021 | 14.388 | 13.797 |
| 2022 | 14.358 | 13.778 |
| 2023 | 14.358 | 13.778 |
| 2024 | 14.358 | 13.778 |
| 2025 | 14.358 | 13.728 |
| 2026 | 14.358 | 13.728 |
| 2027 | 14.358 | 13.728 |
| 2028 | 14.358 | 13.728 |
| 2029 | 14.288 | 13.698 |
| 2030 | 14.288 | 13.698 |
| 2031 | 14.288 | 13.698 |
| 2032 | 15.238 | 14.658 |
| 2033 | 15.238 | 14.658 |
| 2034 | 15.238 | 14.658 |
| 2035 | 15.238 | 14.658 |
| 2036 | 15.388 | 14.798 |
| 2037 | 15.388 | 14.798 |
| 2038 | 15.388 | 14.798 |
| 2039 | 15.528 | 14.948 |
| 2040 | 15.528 | 14.948 |
| 2041 | 15.528 | 14.948 |
| 2042 | 15.528 | 14.948 |
| 2043 | 15.628 | 15.087 |
| 2044 | 15.628 | 15.087 |
| 2045 | 15.628 | 15.087 |
| 2046 | 15.728 | 15.188 |
| 2047 | 15.728 | 15.188 |
| 2048 | 15.728 | 15.188 |
| 2049 | 15.728 | 15.188 |
| 2050 | 15.798 | 15.357 |
| 2051 | 15.798 | 15.357 |
| 2052 | 15.798 | 15.357 |
| 2053 | 15.948 | 15.488 |
| 2054 | 15.948 | 15.488 |
| 2055 | 15.948 | 15.488 |
| 2056 | 15.948 | 15.488 |
| 2057 | 14.998 | 14.577 |
| 2058 | 14.998 | 14.577 |
| 2059 | 14.998 | 14.577 |
| 2060 | 15.018 | 14.577 |
| 2061 | 15.018 | 14.577 |
| 2062 | 15.018 | 14.577 |
| 2063 | 15.018 | 14.577 |
| 2064 | 14.798 | 14.358 |
| 2065 | 14.798 | 14.358 |
| 2066 | 14.798 | 14.358 |
| 2067 | 15.047 | 14.627 |
| 2068 | 15.047 | 14.627 |
| 2069 | 15.047 | 14.627 |
| 2070 | 15.047 | 14.627 |
| 2071 | 15.528 | 15.087 |
| 2072 | 15.528 | 15.087 |
| 2073 | 15.528 | 15.087 |
| 2074 | 15.528 | 15.087 |
| 2075 | 15.927 | 15.488 |
| 2076 | 15.927 | 15.488 |
| 2077 | 15.927 | 15.488 |
| 2078 | 15.927 | 15.528 |
| 2079 | 15.927 | 15.528 |
| 2080 | 15.927 | 15.528 |
| 2081 | 15.927 | 15.528 |
| 2082 | 16.018 | 15.657 |
| 2083 | 16.018 | 15.657 |
| 2084 | 16.018 | 15.657 |
| 2085 | 16.098 | 15.708 |
| 2086 | 16.098 | 15.708 |
| 2087 | 16.098 | 15.708 |
| 2088 | 16.098 | 15.708 |
| 2089 | 16.168 | 15.827 |
| 2090 | 16.168 | 15.827 |
| 2091 | 16.168 | 15.827 |
| 2092 | 15.557 | 15.288 |
| 2093 | 15.557 | 15.288 |
| 2094 | 15.557 | 15.288 |
| 2095 | 15.557 | 15.288 |
| 2096 | 15.798 | 15.578 |
| 2097 | 15.798 | 15.578 |
| 2098 | 15.798 | 15.578 |
| 2099 | 15.798 | 15.578 |
| 2100 | 15.438 | 15.168 |
| 2101 | 15.438 | 15.168 |
| 2102 | 15.438 | 15.168 |
| 2103 | 16.148 | 15.827 |
| 2104 | 16.148 | 15.827 |
| 2105 | 16.148 | 15.827 |
| 2106 | 16.148 | 15.827 |
| 2107 | 16.318 | 16.068 |
| 2108 | 16.318 | 16.068 |
| 2109 | 16.318 | 16.068 |
| 2110 | 16.408 | 16.168 |
| 2111 | 16.408 | 16.168 |
| 2112 | 16.408 | 16.168 |
| 2113 | 16.408 | 16.168 |
| 2114 | 16.557 | 16.337 |
| 2115 | 16.557 | 16.337 |
| 2116 | 16.557 | 16.337 |
| 2117 | 16.557 | 16.337 |
| 2118 | 16.537 | 16.337 |
| 2119 | 16.537 | 16.337 |
| 2120 | 16.537 | 16.337 |
| 2121 | 16.607 | 16.458 |
| 2122 | 16.607 | 16.458 |
| 2123 | 16.607 | 16.458 |
| 2124 | 16.607 | 16.458 |
| 2125 | 16.707 | 16.557 |
| 2126 | 16.707 | 16.557 |
| 2127 | 16.707 | 16.557 |
| 2128 | 16.778 | 16.628 |
| 2129 | 16.778 | 16.628 |
| 2130 | 16.778 | 16.628 |
| 2131 | 16.778 | 16.628 |
| 2132 | 16.817 | 16.678 |
| 2133 | 16.817 | 16.678 |
| 2134 | 16.817 | 16.678 |
| 2135 | 16.928 | 16.848 |
| 2136 | 16.928 | 16.848 |
| 2137 | 16.928 | 16.848 |
| 2138 | 16.928 | 16.848 |
| 2139 | 16.998 | 16.898 |
| 2140 | 16.998 | 16.898 |
| 2141 | 16.998 | 16.898 |
| 2142 | 17.098 | 16.998 |
| 2143 | 17.098 | 16.998 |
| 2144 | 17.098 | 16.998 |
| 2145 | 17.067 | 16.978 |
| 2146 | 17.067 | 16.978 |
| 2147 | 17.067 | 16.978 |
| 2148 | 17.067 | 16.978 |
| 2149 | 17.067 | 16.998 |
| 2150 | 17.067 | 16.998 |
| 2151 | 17.067 | 16.998 |
| 2152 | 17.167 | 17.067 |
| 2153 | 17.167 | 17.067 |
| 2154 | 17.167 | 17.067 |
| 2155 | 17.167 | 17.067 |
| 2156 | 17.198 | 17.098 |
| 2157 | 17.198 | 17.098 |
| 2158 | 17.198 | 17.098 |
| 2159 | 17.198 | 17.098 |
| 2160 | 17.258 | 17.167 |
| 2161 | 17.258 | 17.167 |
| 2162 | 17.258 | 17.167 |
| 2163 | 17.337 | 17.217 |
| 2164 | 17.337 | 17.217 |
| 2165 | 17.337 | 17.217 |
| 2166 | 17.337 | 17.217 |
| 2167 | 17.317 | 17.217 |
| 2168 | 17.317 | 17.217 |
| 2169 | 17.317 | 17.217 |
| 2170 | 17.287 | 17.198 |
| 2171 | 17.287 | 17.198 |
| 2172 | 17.287 | 17.198 |
| 2173 | 17.287 | 17.198 |
| 2174 | 17.337 | 17.217 |
| 2175 | 17.337 | 17.217 |
| 2176 | 17.337 | 17.217 |
| 2177 | 17.337 | 17.217 |
| 2178 | 17.317 | 17.217 |
| 2179 | 17.317 | 17.217 |
| 2180 | 17.317 | 17.217 |
| 2181 | 17.167 | 16.928 |
| 2182 | 17.167 | 16.928 |
| 2183 | 17.167 | 16.928 |
| 2184 | 17.167 | 16.928 |
| 2185 | 17.048 | 16.898 |
| 2186 | 17.048 | 16.898 |
| 2187 | 17.048 | 16.898 |
| 2188 | 17.468 | 17.287 |
| 2189 | 17.468 | 17.287 |
| 2190 | 17.468 | 17.287 |
| 2191 | 17.468 | 17.287 |
| 2192 | 17.637 | 17.558 |
| 2193 | 17.637 | 17.558 |
| 2194 | 17.637 | 17.558 |
| 2195 | 17.658 | 17.487 |
| 2196 | 17.658 | 17.487 |
| 2197 | 17.658 | 17.487 |
| 2198 | 17.658 | 17.487 |
| 2199 | 17.248 | 17.117 |
| 2200 | 17.248 | 17.117 |
| 2201 | 17.248 | 17.117 |
| 2202 | 17.248 | 17.117 |
| 2203 | 16.928 | 16.778 |
| 2204 | 16.928 | 16.778 |
| 2205 | 16.928 | 16.778 |
| 2206 | 16.848 | 16.728 |
| 2207 | 16.848 | 16.728 |
| 2208 | 16.848 | 16.728 |
| 2209 | 16.848 | 16.728 |
| 2210 | 16.757 | 16.678 |
| 2211 | 16.757 | 16.678 |
| 2212 | 16.757 | 16.678 |
| 2213 | 16.707 | 16.628 |
| 2214 | 16.707 | 16.628 |
| 2215 | 16.707 | 16.628 |
| 2216 | 16.707 | 16.628 |
| 2217 | 16.657 | 16.588 |
| 2218 | 16.657 | 16.588 |
| 2219 | 16.657 | 16.588 |
| 2220 | 16.657 | 16.588 |
| 2221 | 16.557 | 16.487 |
| 2222 | 16.557 | 16.487 |
| 2223 | 16.557 | 16.487 |
| 2224 | 16.018 | 15.948 |
| 2225 | 16.018 | 15.948 |
| 2226 | 16.018 | 15.948 |
| 2227 | 16.018 | 15.948 |
| 2228 | 16.948 | 16.878 |
| 2229 | 16.948 | 16.878 |
| 2230 | 16.948 | 16.878 |
| 2231 | 17.027 | 16.898 |
| 2232 | 17.027 | 16.898 |
| 2233 | 17.027 | 16.898 |
| 2234 | 16.978 | 16.848 |
| 2235 | 16.978 | 16.848 |
| 2236 | 16.978 | 16.848 |
| 2237 | 16.978 | 16.848 |
| 2238 | 17.198 | 17.048 |
| 2239 | 17.198 | 17.048 |
| 2240 | 17.198 | 17.048 |
| 2241 | 17.217 | 17.117 |
| 2242 | 17.217 | 17.117 |
| 2243 | 17.217 | 17.117 |
| 2244 | 17.217 | 17.117 |
| 2245 | 17.298 | 17.198 |
| 2246 | 17.298 | 17.198 |
| 2247 | 17.298 | 17.198 |
| 2248 | 17.267 | 17.167 |
| 2249 | 17.267 | 17.167 |
| 2250 | 17.267 | 17.167 |
| 2251 | 17.267 | 17.167 |
| 2252 | 17.367 | 17.267 |
| 2253 | 17.367 | 17.267 |
| 2254 | 17.367 | 17.267 |
| 2255 | 17.367 | 17.267 |
| 2256 | 17.367 | 17.217 |
| 2257 | 17.367 | 17.217 |
| 2258 | 17.367 | 17.217 |
| 2259 | 17.468 | 17.317 |
| 2260 | 17.468 | 17.317 |
| 2261 | 17.468 | 17.317 |
| 2262 | 17.468 | 17.317 |
| 2263 | 17.487 | 17.317 |
| 2264 | 17.487 | 17.317 |
| 2265 | 17.487 | 17.317 |
| 2266 | 17.587 | 17.418 |
| 2267 | 17.587 | 17.418 |
| 2268 | 17.587 | 17.418 |
| 2269 | 17.587 | 17.418 |
| 2270 | 17.558 | 17.387 |
| 2271 | 17.558 | 17.387 |
| 2272 | 17.558 | 17.387 |
| 2273 | 17.558 | 17.387 |
| 2274 | 17.608 | 17.418 |
| 2275 | 17.608 | 17.418 |
| 2276 | 17.608 | 17.418 |
| 2277 | 17.658 | 17.468 |
| 2278 | 17.658 | 17.468 |
| 2279 | 17.658 | 17.468 |
| 2280 | 17.098 | 16.898 |
| 2281 | 17.098 | 16.898 |
| 2282 | 17.098 | 16.898 |
| 2283 | 16.807 | 16.628 |
| 2284 | 16.807 | 16.628 |
| 2285 | 16.807 | 16.628 |
| 2286 | 16.807 | 16.628 |
| 2287 | 16.898 | 16.707 |
| 2288 | 16.898 | 16.707 |
| 2289 | 16.898 | 16.707 |
| 2290 | 16.998 | 16.828 |
| 2291 | 16.998 | 16.828 |
| 2292 | 16.998 | 16.828 |
| 2293 | 16.998 | 16.828 |
| 2294 | 16.898 | 16.757 |
| 2295 | 16.898 | 16.757 |
| 2296 | 16.898 | 16.757 |
| 2297 | 17.048 | 16.928 |
| 2298 | 17.048 | 16.928 |
| 2299 | 17.048 | 16.928 |
| 2300 | 17.048 | 16.928 |
| 2301 | 17.048 | 16.928 |
| 2302 | 17.048 | 16.928 |
| 2303 | 17.048 | 16.928 |
| 2304 | 17.048 | 16.928 |
| 2305 | 17.048 | 16.898 |
| 2306 | 17.048 | 16.898 |
| 2307 | 17.048 | 16.898 |
| 2308 | 17.248 | 17.117 |
| 2309 | 17.248 | 17.117 |
| 2310 | 17.248 | 17.117 |
| 2311 | 17.248 | 17.117 |
| 2312 | 17.508 | 17.387 |
| 2313 | 17.508 | 17.387 |
| 2314 | 17.508 | 17.387 |
| 2315 | 17.148 | 16.978 |
| 2316 | 17.148 | 16.978 |
| 2317 | 17.148 | 16.978 |
| 2318 | 16.678 | 16.537 |
| 2319 | 16.678 | 16.537 |
| 2320 | 16.678 | 16.537 |
| 2321 | 16.678 | 16.537 |
| 2322 | 16.437 | 16.268 |
| 2323 | 16.437 | 16.268 |
| 2324 | 16.437 | 16.268 |
| 2325 | 16.248 | 16.098 |
| 2326 | 16.248 | 16.098 |
| 2327 | 16.248 | 16.098 |
| 2328 | 16.248 | 16.098 |
| 2329 | 16.018 | 15.877 |
| 2330 | 16.018 | 15.877 |
| 2331 | 16.018 | 15.877 |
| 2332 | 16.018 | 15.877 |
| 2333 | 15.738 | 15.628 |
| 2334 | 15.738 | 15.628 |
| 2335 | 15.738 | 15.628 |
| 2336 | 16.948 | 16.878 |
| 2337 | 16.948 | 16.878 |
| 2338 | 16.948 | 16.878 |
| 2339 | 17.067 | 16.898 |
| 2340 | 17.067 | 16.898 |
| 2341 | 17.067 | 16.898 |
| 2342 | 17.067 | 16.898 |
| 2343 | 17.148 | 17.048 |
| 2344 | 17.148 | 17.048 |
| 2345 | 17.148 | 17.048 |
| 2346 | 17.148 | 17.048 |
| 2347 | 16.408 | 16.287 |
| 2348 | 16.408 | 16.287 |
| 2349 | 16.408 | 16.287 |
| 2350 | 16.148 | 16.048 |
| 2351 | 16.148 | 16.048 |
| 2352 | 16.148 | 16.048 |
| 2353 | 16.048 | 15.967 |
| 2354 | 16.048 | 15.967 |
| 2355 | 16.048 | 15.967 |
| 2356 | 16.048 | 15.967 |
| 2357 | 15.858 | 15.798 |
| 2358 | 15.858 | 15.798 |
| 2359 | 15.858 | 15.798 |
| 2360 | 15.777 | 15.708 |
| 2361 | 15.777 | 15.708 |
| 2362 | 15.777 | 15.708 |
| 2363 | 15.777 | 15.708 |
| 2364 | 15.777 | 15.708 |
| 2365 | 15.777 | 15.708 |
| 2366 | 15.777 | 15.708 |
| 2367 | 16.068 | 15.998 |
| 2368 | 16.068 | 15.998 |
| 2369 | 16.068 | 15.998 |
| 2370 | 16.068 | 15.998 |
| 2371 | 16.287 | 16.148 |
| 2372 | 16.287 | 16.148 |
| 2373 | 16.287 | 16.148 |
| 2374 | 16.287 | 16.148 |